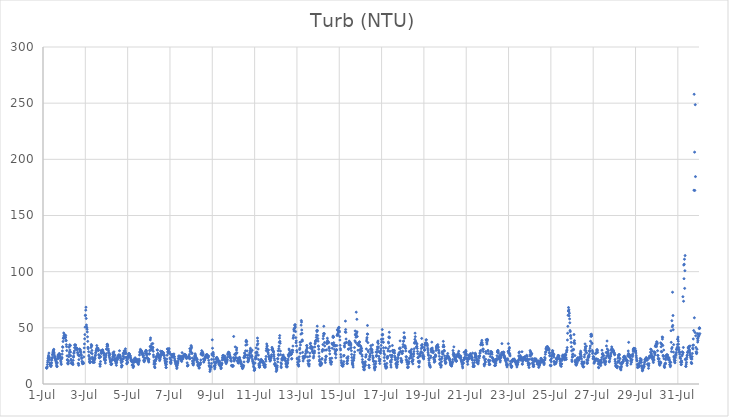
| Category | Turb (NTU) |
|---|---|
| 44743.166666666664 | 14.4 |
| 44743.177083333336 | 14.01 |
| 44743.1875 | 14.77 |
| 44743.197916666664 | 15.36 |
| 44743.208333333336 | 17.35 |
| 44743.21875 | 19.37 |
| 44743.229166666664 | 20.86 |
| 44743.239583333336 | 22.7 |
| 44743.25 | 23.81 |
| 44743.260416666664 | 25.5 |
| 44743.270833333336 | 24.44 |
| 44743.28125 | 27.52 |
| 44743.291666666664 | 22.97 |
| 44743.302083333336 | 23.61 |
| 44743.3125 | 21.58 |
| 44743.322916666664 | 18.9 |
| 44743.333333333336 | 17.59 |
| 44743.34375 | 17.52 |
| 44743.354166666664 | 16.21 |
| 44743.364583333336 | 16.47 |
| 44743.375 | 15.57 |
| 44743.385416666664 | 18.74 |
| 44743.395833333336 | 16.57 |
| 44743.40625 | 18.84 |
| 44743.416666666664 | 21.19 |
| 44743.427083333336 | 22.76 |
| 44743.4375 | 23.56 |
| 44743.447916666664 | 25.94 |
| 44743.458333333336 | 26.6 |
| 44743.46875 | 27.89 |
| 44743.479166666664 | 29.06 |
| 44743.489583333336 | 29.71 |
| 44743.5 | 30.24 |
| 44743.510416666664 | 30.88 |
| 44743.520833333336 | 28.19 |
| 44743.53125 | 26.65 |
| 44743.541666666664 | 24.9 |
| 44743.552083333336 | 23.73 |
| 44743.5625 | 24.3 |
| 44743.572916666664 | 22.57 |
| 44743.583333333336 | 22.98 |
| 44743.59375 | 21.57 |
| 44743.604166666664 | 21.01 |
| 44743.614583333336 | 19.93 |
| 44743.625 | 19.46 |
| 44743.635416666664 | 18.03 |
| 44743.645833333336 | 16.54 |
| 44743.65625 | 15.48 |
| 44743.666666666664 | 15.66 |
| 44743.677083333336 | 18.86 |
| 44743.6875 | 22.33 |
| 44743.697916666664 | 24.09 |
| 44743.708333333336 | 25.77 |
| 44743.71875 | 25.64 |
| 44743.729166666664 | 22.9 |
| 44743.739583333336 | 24.09 |
| 44743.75 | 25.44 |
| 44743.760416666664 | 26.64 |
| 44743.770833333336 | 27.17 |
| 44743.78125 | 25.83 |
| 44743.791666666664 | 26.3 |
| 44743.802083333336 | 25.07 |
| 44743.8125 | 23.76 |
| 44743.822916666664 | 22.84 |
| 44743.833333333336 | 21.23 |
| 44743.84375 | 19.86 |
| 44743.854166666664 | 18.59 |
| 44743.864583333336 | 17.41 |
| 44743.875 | 22.42 |
| 44743.885416666664 | 22.65 |
| 44743.895833333336 | 23.63 |
| 44743.90625 | 26.59 |
| 44743.916666666664 | 29.39 |
| 44743.927083333336 | 33.14 |
| 44743.9375 | 32.75 |
| 44743.947916666664 | 37.85 |
| 44743.958333333336 | 40.79 |
| 44743.96875 | 40.76 |
| 44743.979166666664 | 45.38 |
| 44743.989583333336 | 42.96 |
| 44744.0 | 42.14 |
| 44744.010416666664 | 40.98 |
| 44744.020833333336 | 41.68 |
| 44744.03125 | 43.91 |
| 44744.041666666664 | 42 |
| 44744.052083333336 | 41.17 |
| 44744.0625 | 41.36 |
| 44744.072916666664 | 43.15 |
| 44744.083333333336 | 38.93 |
| 44744.09375 | 38.52 |
| 44744.104166666664 | 35.05 |
| 44744.114583333336 | 33.26 |
| 44744.125 | 29.78 |
| 44744.135416666664 | 25.08 |
| 44744.145833333336 | 21.38 |
| 44744.15625 | 21.68 |
| 44744.166666666664 | 18.72 |
| 44744.177083333336 | 17.98 |
| 44744.1875 | 17.88 |
| 44744.197916666664 | 18.67 |
| 44744.208333333336 | 20.43 |
| 44744.21875 | 24.26 |
| 44744.229166666664 | 32.73 |
| 44744.239583333336 | 26.37 |
| 44744.25 | 28.37 |
| 44744.260416666664 | 34.87 |
| 44744.270833333336 | 30.29 |
| 44744.28125 | 34.5 |
| 44744.291666666664 | 34.1 |
| 44744.302083333336 | 28.42 |
| 44744.3125 | 25.2 |
| 44744.322916666664 | 22.08 |
| 44744.333333333336 | 20.9 |
| 44744.34375 | 18.67 |
| 44744.354166666664 | 18.15 |
| 44744.364583333336 | 18.71 |
| 44744.375 | 18.35 |
| 44744.385416666664 | 18.88 |
| 44744.395833333336 | 18.67 |
| 44744.40625 | 18.01 |
| 44744.416666666664 | 17.29 |
| 44744.427083333336 | 21.03 |
| 44744.4375 | 23.84 |
| 44744.447916666664 | 24.77 |
| 44744.458333333336 | 27.26 |
| 44744.46875 | 27.88 |
| 44744.479166666664 | 29.35 |
| 44744.489583333336 | 32.32 |
| 44744.5 | 34.85 |
| 44744.510416666664 | 34.69 |
| 44744.520833333336 | 34.36 |
| 44744.53125 | 32.27 |
| 44744.541666666664 | 34.81 |
| 44744.552083333336 | 31.1 |
| 44744.5625 | 30.94 |
| 44744.572916666664 | 31.24 |
| 44744.583333333336 | 32.24 |
| 44744.59375 | 30.4 |
| 44744.604166666664 | 31.6 |
| 44744.614583333336 | 31.41 |
| 44744.625 | 30.93 |
| 44744.635416666664 | 28.02 |
| 44744.645833333336 | 27.64 |
| 44744.65625 | 25.94 |
| 44744.666666666664 | 18.22 |
| 44744.677083333336 | 18.21 |
| 44744.6875 | 16.66 |
| 44744.697916666664 | 21.72 |
| 44744.708333333336 | 24.9 |
| 44744.71875 | 25.7 |
| 44744.729166666664 | 31.25 |
| 44744.739583333336 | 29.37 |
| 44744.75 | 30 |
| 44744.760416666664 | 30.59 |
| 44744.770833333336 | 29.13 |
| 44744.78125 | 28.19 |
| 44744.791666666664 | 25.67 |
| 44744.802083333336 | 26.51 |
| 44744.8125 | 25.55 |
| 44744.822916666664 | 23.44 |
| 44744.833333333336 | 22.7 |
| 44744.84375 | 20.12 |
| 44744.854166666664 | 19.51 |
| 44744.864583333336 | 18.11 |
| 44744.875 | 18.68 |
| 44744.885416666664 | 18.14 |
| 44744.895833333336 | 19.46 |
| 44744.90625 | 18.5 |
| 44744.916666666664 | 18.35 |
| 44744.927083333336 | 24.13 |
| 44744.9375 | 28.42 |
| 44744.947916666664 | 32.11 |
| 44744.958333333336 | 35.66 |
| 44744.96875 | 40.22 |
| 44744.979166666664 | 43.97 |
| 44744.989583333336 | 50.62 |
| 44745.0 | 60.97 |
| 44745.010416666664 | 61.2 |
| 44745.020833333336 | 65.72 |
| 44745.03125 | 68.35 |
| 44745.041666666664 | 58.34 |
| 44745.052083333336 | 52.52 |
| 44745.0625 | 50.55 |
| 44745.072916666664 | 50.01 |
| 44745.083333333336 | 48.65 |
| 44745.09375 | 46.33 |
| 44745.104166666664 | 41.99 |
| 44745.114583333336 | 37.97 |
| 44745.125 | 32.64 |
| 44745.135416666664 | 31.42 |
| 44745.15625 | 28.76 |
| 44745.166666666664 | 25.52 |
| 44745.177083333336 | 24.43 |
| 44745.1875 | 22.18 |
| 44745.197916666664 | 20.25 |
| 44745.208333333336 | 19.49 |
| 44745.21875 | 18.89 |
| 44745.229166666664 | 19.65 |
| 44745.239583333336 | 19.88 |
| 44745.25 | 22.88 |
| 44745.260416666664 | 27.85 |
| 44745.270833333336 | 32.48 |
| 44745.28125 | 35.12 |
| 44745.291666666664 | 33.95 |
| 44745.302083333336 | 34.12 |
| 44745.3125 | 29.83 |
| 44745.322916666664 | 26.96 |
| 44745.333333333336 | 23.92 |
| 44745.34375 | 21.9 |
| 44745.354166666664 | 19.91 |
| 44745.364583333336 | 19.36 |
| 44745.375 | 19.14 |
| 44745.385416666664 | 22.78 |
| 44745.395833333336 | 21.23 |
| 44745.40625 | 21.66 |
| 44745.416666666664 | 20.67 |
| 44745.427083333336 | 19.25 |
| 44745.4375 | 21.78 |
| 44745.447916666664 | 23.19 |
| 44745.458333333336 | 22.83 |
| 44745.46875 | 24.99 |
| 44745.479166666664 | 25.73 |
| 44745.489583333336 | 27.65 |
| 44745.5 | 28.37 |
| 44745.510416666664 | 29.55 |
| 44745.520833333336 | 30.11 |
| 44745.53125 | 31.31 |
| 44745.541666666664 | 34.21 |
| 44745.552083333336 | 30.25 |
| 44745.5625 | 32.24 |
| 44745.572916666664 | 30.97 |
| 44745.583333333336 | 30.69 |
| 44745.59375 | 30.37 |
| 44745.604166666664 | 31.75 |
| 44745.614583333336 | 29.77 |
| 44745.625 | 30.13 |
| 44745.635416666664 | 26.19 |
| 44745.645833333336 | 25.62 |
| 44745.65625 | 23.42 |
| 44745.666666666664 | 23.22 |
| 44745.677083333336 | 25.14 |
| 44745.6875 | 17.89 |
| 44745.697916666664 | 15.79 |
| 44745.708333333336 | 17.45 |
| 44745.71875 | 19.98 |
| 44745.729166666664 | 24.22 |
| 44745.739583333336 | 29.7 |
| 44745.75 | 28.08 |
| 44745.760416666664 | 27.3 |
| 44745.770833333336 | 27.52 |
| 44745.78125 | 29.8 |
| 44745.791666666664 | 29.36 |
| 44745.802083333336 | 29.84 |
| 44745.8125 | 30.43 |
| 44745.822916666664 | 30.03 |
| 44745.833333333336 | 28.8 |
| 44745.84375 | 28.15 |
| 44745.854166666664 | 27.33 |
| 44745.864583333336 | 27.53 |
| 44745.875 | 26.93 |
| 44745.885416666664 | 25.33 |
| 44745.895833333336 | 23.21 |
| 44745.90625 | 21.54 |
| 44745.916666666664 | 21.91 |
| 44745.927083333336 | 22.66 |
| 44745.9375 | 20.73 |
| 44745.947916666664 | 18.67 |
| 44745.958333333336 | 21.28 |
| 44745.96875 | 23.97 |
| 44745.979166666664 | 25.78 |
| 44745.989583333336 | 27 |
| 44746.0 | 30.9 |
| 44746.010416666664 | 31.29 |
| 44746.020833333336 | 33.37 |
| 44746.03125 | 35.32 |
| 44746.041666666664 | 35.33 |
| 44746.052083333336 | 34.76 |
| 44746.0625 | 33.78 |
| 44746.072916666664 | 31 |
| 44746.083333333336 | 31.26 |
| 44746.09375 | 29.57 |
| 44746.104166666664 | 28.08 |
| 44746.114583333336 | 27.61 |
| 44746.125 | 25.05 |
| 44746.135416666664 | 25.63 |
| 44746.145833333336 | 23.63 |
| 44746.15625 | 22.29 |
| 44746.166666666664 | 26.61 |
| 44746.177083333336 | 20.51 |
| 44746.1875 | 19.58 |
| 44746.197916666664 | 19.98 |
| 44746.208333333336 | 17.52 |
| 44746.21875 | 17.89 |
| 44746.229166666664 | 17.3 |
| 44746.239583333336 | 17.75 |
| 44746.25 | 18.03 |
| 44746.260416666664 | 21.37 |
| 44746.270833333336 | 22.05 |
| 44746.28125 | 21.35 |
| 44746.291666666664 | 24.02 |
| 44746.302083333336 | 27.65 |
| 44746.3125 | 26.17 |
| 44746.322916666664 | 24.72 |
| 44746.333333333336 | 25.53 |
| 44746.34375 | 27.58 |
| 44746.354166666664 | 28.66 |
| 44746.364583333336 | 24.18 |
| 44746.375 | 22.24 |
| 44746.385416666664 | 21.14 |
| 44746.395833333336 | 21.32 |
| 44746.40625 | 25.66 |
| 44746.416666666664 | 22.56 |
| 44746.427083333336 | 20.08 |
| 44746.4375 | 20.69 |
| 44746.447916666664 | 18.4 |
| 44746.458333333336 | 19.09 |
| 44746.46875 | 16.64 |
| 44746.479166666664 | 18.99 |
| 44746.489583333336 | 20.63 |
| 44746.5 | 23.16 |
| 44746.510416666664 | 21.83 |
| 44746.520833333336 | 21.85 |
| 44746.53125 | 24.05 |
| 44746.541666666664 | 23.2 |
| 44746.552083333336 | 24.67 |
| 44746.5625 | 25.23 |
| 44746.572916666664 | 24.7 |
| 44746.583333333336 | 26.03 |
| 44746.59375 | 25.86 |
| 44746.604166666664 | 25.17 |
| 44746.614583333336 | 29.58 |
| 44746.625 | 23.93 |
| 44746.635416666664 | 23.83 |
| 44746.645833333336 | 25.58 |
| 44746.65625 | 24.05 |
| 44746.666666666664 | 22.85 |
| 44746.677083333336 | 20.76 |
| 44746.6875 | 21.73 |
| 44746.697916666664 | 18.89 |
| 44746.708333333336 | 15.05 |
| 44746.71875 | 16.55 |
| 44746.729166666664 | 16.12 |
| 44746.739583333336 | 16.34 |
| 44746.75 | 19.92 |
| 44746.760416666664 | 21.97 |
| 44746.770833333336 | 22.09 |
| 44746.78125 | 24.71 |
| 44746.791666666664 | 26.93 |
| 44746.802083333336 | 27.62 |
| 44746.8125 | 22.72 |
| 44746.822916666664 | 24.27 |
| 44746.833333333336 | 29.47 |
| 44746.84375 | 28.33 |
| 44746.854166666664 | 26.95 |
| 44746.864583333336 | 28.37 |
| 44746.875 | 28.12 |
| 44746.885416666664 | 29.81 |
| 44746.895833333336 | 31.32 |
| 44746.90625 | 28.27 |
| 44746.916666666664 | 26.98 |
| 44746.927083333336 | 23.71 |
| 44746.9375 | 23.58 |
| 44746.947916666664 | 21.05 |
| 44746.958333333336 | 17.95 |
| 44746.96875 | 18.33 |
| 44746.979166666664 | 19.01 |
| 44746.989583333336 | 21.64 |
| 44747.0 | 19.44 |
| 44747.010416666664 | 23.24 |
| 44747.020833333336 | 23.87 |
| 44747.03125 | 25.16 |
| 44747.041666666664 | 25.65 |
| 44747.052083333336 | 26.89 |
| 44747.0625 | 27.16 |
| 44747.072916666664 | 26.46 |
| 44747.083333333336 | 26.8 |
| 44747.09375 | 25.47 |
| 44747.104166666664 | 24.8 |
| 44747.114583333336 | 24.57 |
| 44747.125 | 25.17 |
| 44747.135416666664 | 23.49 |
| 44747.145833333336 | 22.58 |
| 44747.15625 | 21.36 |
| 44747.166666666664 | 21.21 |
| 44747.177083333336 | 21 |
| 44747.1875 | 20.22 |
| 44747.197916666664 | 19.75 |
| 44747.208333333336 | 19.77 |
| 44747.21875 | 16.64 |
| 44747.229166666664 | 17.17 |
| 44747.239583333336 | 20.96 |
| 44747.25 | 17.07 |
| 44747.260416666664 | 14.66 |
| 44747.270833333336 | 15.79 |
| 44747.28125 | 15.83 |
| 44747.291666666664 | 19.09 |
| 44747.302083333336 | 20.18 |
| 44747.3125 | 22.25 |
| 44747.322916666664 | 20.14 |
| 44747.333333333336 | 20.93 |
| 44747.34375 | 20.51 |
| 44747.354166666664 | 23.34 |
| 44747.364583333336 | 20.38 |
| 44747.375 | 20.67 |
| 44747.385416666664 | 22.01 |
| 44747.395833333336 | 19.84 |
| 44747.40625 | 20.47 |
| 44747.416666666664 | 20.45 |
| 44747.427083333336 | 20.85 |
| 44747.4375 | 21.99 |
| 44747.447916666664 | 20.67 |
| 44747.458333333336 | 20.7 |
| 44747.46875 | 19.66 |
| 44747.479166666664 | 19.86 |
| 44747.489583333336 | 18.22 |
| 44747.5 | 18.37 |
| 44747.510416666664 | 17.35 |
| 44747.520833333336 | 19.29 |
| 44747.53125 | 20.85 |
| 44747.541666666664 | 22.15 |
| 44747.552083333336 | 20.59 |
| 44747.5625 | 25.81 |
| 44747.572916666664 | 28.46 |
| 44747.583333333336 | 27.7 |
| 44747.59375 | 28.62 |
| 44747.604166666664 | 30.83 |
| 44747.614583333336 | 29.48 |
| 44747.625 | 28.88 |
| 44747.635416666664 | 29.6 |
| 44747.645833333336 | 29.83 |
| 44747.65625 | 28.63 |
| 44747.666666666664 | 28.76 |
| 44747.677083333336 | 28.25 |
| 44747.6875 | 26.65 |
| 44747.697916666664 | 27.02 |
| 44747.708333333336 | 26.02 |
| 44747.71875 | 27.21 |
| 44747.729166666664 | 25.15 |
| 44747.739583333336 | 23.98 |
| 44747.75 | 25.39 |
| 44747.760416666664 | 20.72 |
| 44747.770833333336 | 21.43 |
| 44747.78125 | 19.75 |
| 44747.791666666664 | 21.08 |
| 44747.802083333336 | 20.71 |
| 44747.8125 | 22.81 |
| 44747.822916666664 | 23.07 |
| 44747.833333333336 | 27.13 |
| 44747.84375 | 28.72 |
| 44747.854166666664 | 29.15 |
| 44747.864583333336 | 29.97 |
| 44747.875 | 28.71 |
| 44747.885416666664 | 29.63 |
| 44747.895833333336 | 26.87 |
| 44747.90625 | 25.31 |
| 44747.916666666664 | 27.04 |
| 44747.927083333336 | 23.34 |
| 44747.9375 | 22.89 |
| 44747.947916666664 | 22.38 |
| 44747.958333333336 | 22.45 |
| 44747.96875 | 22.34 |
| 44747.979166666664 | 21.09 |
| 44747.989583333336 | 20.26 |
| 44748.0 | 19.5 |
| 44748.010416666664 | 22.07 |
| 44748.020833333336 | 26.98 |
| 44748.03125 | 26.73 |
| 44748.041666666664 | 29.54 |
| 44748.052083333336 | 30.28 |
| 44748.0625 | 33.33 |
| 44748.072916666664 | 39.27 |
| 44748.083333333336 | 41 |
| 44748.09375 | 33.84 |
| 44748.104166666664 | 33.6 |
| 44748.114583333336 | 32.57 |
| 44748.125 | 31.89 |
| 44748.135416666664 | 35.65 |
| 44748.145833333336 | 30.31 |
| 44748.15625 | 30.77 |
| 44748.166666666664 | 31.09 |
| 44748.177083333336 | 32.84 |
| 44748.1875 | 36 |
| 44748.197916666664 | 32.38 |
| 44748.208333333336 | 29.15 |
| 44748.21875 | 25.86 |
| 44748.229166666664 | 24.12 |
| 44748.239583333336 | 17.7 |
| 44748.25 | 20.58 |
| 44748.260416666664 | 19.17 |
| 44748.270833333336 | 15.31 |
| 44748.28125 | 17.36 |
| 44748.291666666664 | 14.5 |
| 44748.302083333336 | 18.04 |
| 44748.3125 | 20.25 |
| 44748.322916666664 | 21.62 |
| 44748.333333333336 | 22.09 |
| 44748.34375 | 21.71 |
| 44748.354166666664 | 23.19 |
| 44748.364583333336 | 24.41 |
| 44748.375 | 24.76 |
| 44748.385416666664 | 24.65 |
| 44748.395833333336 | 30.39 |
| 44748.40625 | 30.15 |
| 44748.416666666664 | 26.9 |
| 44748.427083333336 | 26.49 |
| 44748.4375 | 27.21 |
| 44748.447916666664 | 26.15 |
| 44748.458333333336 | 26.12 |
| 44748.46875 | 23.24 |
| 44748.479166666664 | 24.33 |
| 44748.489583333336 | 25.33 |
| 44748.5 | 25.25 |
| 44748.510416666664 | 20.77 |
| 44748.520833333336 | 22.64 |
| 44748.53125 | 21.91 |
| 44748.541666666664 | 23.56 |
| 44748.552083333336 | 29.19 |
| 44748.5625 | 24.92 |
| 44748.572916666664 | 26.08 |
| 44748.583333333336 | 25.83 |
| 44748.59375 | 27.36 |
| 44748.604166666664 | 27.97 |
| 44748.614583333336 | 28.9 |
| 44748.625 | 28.98 |
| 44748.635416666664 | 27.67 |
| 44748.645833333336 | 27.64 |
| 44748.65625 | 28.14 |
| 44748.666666666664 | 28.03 |
| 44748.677083333336 | 25.95 |
| 44748.6875 | 26.73 |
| 44748.697916666664 | 27.84 |
| 44748.708333333336 | 26.19 |
| 44748.71875 | 25.73 |
| 44748.729166666664 | 25.04 |
| 44748.739583333336 | 22.97 |
| 44748.75 | 22.8 |
| 44748.760416666664 | 21.24 |
| 44748.770833333336 | 20.34 |
| 44748.78125 | 18.81 |
| 44748.791666666664 | 18.14 |
| 44748.802083333336 | 16.84 |
| 44748.8125 | 14.77 |
| 44748.822916666664 | 14.62 |
| 44748.833333333336 | 17.52 |
| 44748.84375 | 19.84 |
| 44748.854166666664 | 22.24 |
| 44748.864583333336 | 25.57 |
| 44748.875 | 31.26 |
| 44748.885416666664 | 30.95 |
| 44748.895833333336 | 28.78 |
| 44748.90625 | 28.12 |
| 44748.916666666664 | 27.45 |
| 44748.927083333336 | 29.35 |
| 44748.9375 | 30.36 |
| 44748.947916666664 | 30.37 |
| 44748.958333333336 | 31.61 |
| 44748.96875 | 28.79 |
| 44748.979166666664 | 27.94 |
| 44748.989583333336 | 26.99 |
| 44749.0 | 23.26 |
| 44749.010416666664 | 22.32 |
| 44749.020833333336 | 19.04 |
| 44749.03125 | 19.93 |
| 44749.041666666664 | 18.2 |
| 44749.052083333336 | 19.24 |
| 44749.0625 | 21.2 |
| 44749.072916666664 | 25.54 |
| 44749.083333333336 | 26.29 |
| 44749.09375 | 23.95 |
| 44749.104166666664 | 24.41 |
| 44749.114583333336 | 24.07 |
| 44749.125 | 25.94 |
| 44749.135416666664 | 25 |
| 44749.145833333336 | 26.46 |
| 44749.15625 | 26.15 |
| 44749.166666666664 | 25.3 |
| 44749.177083333336 | 24.7 |
| 44749.1875 | 26.74 |
| 44749.197916666664 | 24.59 |
| 44749.208333333336 | 24.18 |
| 44749.21875 | 22.6 |
| 44749.229166666664 | 21.17 |
| 44749.239583333336 | 20.52 |
| 44749.25 | 19.59 |
| 44749.260416666664 | 20.32 |
| 44749.270833333336 | 17.92 |
| 44749.28125 | 17.86 |
| 44749.291666666664 | 17.06 |
| 44749.302083333336 | 18.37 |
| 44749.3125 | 15.8 |
| 44749.322916666664 | 13.78 |
| 44749.333333333336 | 14.93 |
| 44749.34375 | 19.24 |
| 44749.354166666664 | 16.91 |
| 44749.364583333336 | 18.75 |
| 44749.375 | 18.71 |
| 44749.385416666664 | 20.38 |
| 44749.395833333336 | 22.6 |
| 44749.40625 | 22.79 |
| 44749.416666666664 | 24.99 |
| 44749.427083333336 | 24.66 |
| 44749.4375 | 24.3 |
| 44749.447916666664 | 24.41 |
| 44749.458333333336 | 24.1 |
| 44749.46875 | 24.98 |
| 44749.479166666664 | 22.9 |
| 44749.489583333336 | 22.22 |
| 44749.5 | 22.4 |
| 44749.510416666664 | 21.52 |
| 44749.520833333336 | 22.54 |
| 44749.53125 | 22.72 |
| 44749.541666666664 | 20.86 |
| 44749.552083333336 | 20.06 |
| 44749.5625 | 24.72 |
| 44749.572916666664 | 27.89 |
| 44749.583333333336 | 23.3 |
| 44749.59375 | 23.45 |
| 44749.604166666664 | 22.12 |
| 44749.614583333336 | 22.84 |
| 44749.625 | 24.41 |
| 44749.635416666664 | 24.82 |
| 44749.645833333336 | 24.28 |
| 44749.65625 | 25.83 |
| 44749.666666666664 | 25.23 |
| 44749.677083333336 | 26.38 |
| 44749.6875 | 26.02 |
| 44749.697916666664 | 26.07 |
| 44749.708333333336 | 25.42 |
| 44749.71875 | 25.03 |
| 44749.729166666664 | 26.02 |
| 44749.739583333336 | 25.96 |
| 44749.75 | 24.02 |
| 44749.760416666664 | 23.87 |
| 44749.770833333336 | 24.91 |
| 44749.78125 | 22.67 |
| 44749.791666666664 | 23.21 |
| 44749.802083333336 | 23.19 |
| 44749.8125 | 18.86 |
| 44749.822916666664 | 16.04 |
| 44749.833333333336 | 16.43 |
| 44749.84375 | 16.26 |
| 44749.854166666664 | 16.94 |
| 44749.864583333336 | 23.37 |
| 44749.875 | 23.9 |
| 44749.885416666664 | 24.17 |
| 44749.895833333336 | 24.73 |
| 44749.90625 | 24.32 |
| 44749.916666666664 | 26.28 |
| 44749.927083333336 | 22.47 |
| 44749.9375 | 31.49 |
| 44749.947916666664 | 22.74 |
| 44749.958333333336 | 29.03 |
| 44749.96875 | 29.59 |
| 44749.979166666664 | 28.44 |
| 44749.989583333336 | 31.11 |
| 44750.0 | 34.19 |
| 44750.010416666664 | 33.42 |
| 44750.020833333336 | 32.21 |
| 44750.03125 | 27.88 |
| 44750.041666666664 | 27.1 |
| 44750.052083333336 | 23.1 |
| 44750.0625 | 20.47 |
| 44750.072916666664 | 18.29 |
| 44750.083333333336 | 18.55 |
| 44750.09375 | 17.05 |
| 44750.104166666664 | 17.02 |
| 44750.114583333336 | 18.56 |
| 44750.125 | 20.74 |
| 44750.135416666664 | 21.42 |
| 44750.145833333336 | 22.8 |
| 44750.15625 | 22.23 |
| 44750.166666666664 | 24.54 |
| 44750.177083333336 | 25.2 |
| 44750.1875 | 26.93 |
| 44750.197916666664 | 25.99 |
| 44750.208333333336 | 24.94 |
| 44750.21875 | 23.12 |
| 44750.229166666664 | 23.81 |
| 44750.239583333336 | 23.07 |
| 44750.25 | 22.73 |
| 44750.260416666664 | 21.44 |
| 44750.270833333336 | 20.6 |
| 44750.28125 | 19.48 |
| 44750.291666666664 | 22 |
| 44750.302083333336 | 19.67 |
| 44750.3125 | 17 |
| 44750.322916666664 | 16.21 |
| 44750.333333333336 | 17.81 |
| 44750.34375 | 17.69 |
| 44750.354166666664 | 16.04 |
| 44750.364583333336 | 16.12 |
| 44750.375 | 14.08 |
| 44750.385416666664 | 14.54 |
| 44750.395833333336 | 16.62 |
| 44750.40625 | 17.24 |
| 44750.416666666664 | 17.09 |
| 44750.427083333336 | 17.38 |
| 44750.4375 | 18.85 |
| 44750.447916666664 | 18.78 |
| 44750.458333333336 | 21.37 |
| 44750.46875 | 26.47 |
| 44750.479166666664 | 27.47 |
| 44750.489583333336 | 26.92 |
| 44750.5 | 29.68 |
| 44750.510416666664 | 27.16 |
| 44750.520833333336 | 25.62 |
| 44750.53125 | 26.45 |
| 44750.541666666664 | 28.43 |
| 44750.552083333336 | 25.77 |
| 44750.5625 | 27.33 |
| 44750.572916666664 | 25.83 |
| 44750.583333333336 | 22.19 |
| 44750.59375 | 19.63 |
| 44750.604166666664 | 19.62 |
| 44750.614583333336 | 21.35 |
| 44750.625 | 22.35 |
| 44750.635416666664 | 21.5 |
| 44750.645833333336 | 21.44 |
| 44750.65625 | 22.53 |
| 44750.666666666664 | 23.85 |
| 44750.677083333336 | 24.41 |
| 44750.6875 | 23.9 |
| 44750.697916666664 | 24.29 |
| 44750.708333333336 | 25.91 |
| 44750.71875 | 25.3 |
| 44750.729166666664 | 25.5 |
| 44750.739583333336 | 26.06 |
| 44750.75 | 26.22 |
| 44750.760416666664 | 24.83 |
| 44750.770833333336 | 23.47 |
| 44750.78125 | 24.11 |
| 44750.791666666664 | 23.3 |
| 44750.802083333336 | 24.37 |
| 44750.8125 | 23.95 |
| 44750.822916666664 | 25.03 |
| 44750.833333333336 | 21.03 |
| 44750.84375 | 18.69 |
| 44750.854166666664 | 16.39 |
| 44750.864583333336 | 15.8 |
| 44750.875 | 15.31 |
| 44750.885416666664 | 11.14 |
| 44750.895833333336 | 13.16 |
| 44750.90625 | 12.5 |
| 44750.916666666664 | 15.91 |
| 44750.927083333336 | 15.06 |
| 44750.9375 | 15.48 |
| 44750.947916666664 | 14.84 |
| 44750.958333333336 | 18.26 |
| 44750.96875 | 21.93 |
| 44750.979166666664 | 26.75 |
| 44750.989583333336 | 25.78 |
| 44751.0 | 39.33 |
| 44751.010416666664 | 31.82 |
| 44751.020833333336 | 26.64 |
| 44751.03125 | 26.86 |
| 44751.041666666664 | 28.16 |
| 44751.052083333336 | 26.5 |
| 44751.0625 | 24.6 |
| 44751.072916666664 | 21.8 |
| 44751.083333333336 | 19.29 |
| 44751.09375 | 16.29 |
| 44751.104166666664 | 15.67 |
| 44751.114583333336 | 13.47 |
| 44751.125 | 14.91 |
| 44751.135416666664 | 16.51 |
| 44751.145833333336 | 17.97 |
| 44751.15625 | 18.94 |
| 44751.166666666664 | 19.34 |
| 44751.177083333336 | 19.76 |
| 44751.1875 | 22.97 |
| 44751.197916666664 | 21.82 |
| 44751.208333333336 | 23.57 |
| 44751.21875 | 23.58 |
| 44751.229166666664 | 22.42 |
| 44751.239583333336 | 21.84 |
| 44751.25 | 22.41 |
| 44751.260416666664 | 21.66 |
| 44751.270833333336 | 20.38 |
| 44751.28125 | 21.03 |
| 44751.291666666664 | 19.07 |
| 44751.302083333336 | 20.49 |
| 44751.3125 | 17.88 |
| 44751.322916666664 | 17.25 |
| 44751.333333333336 | 18.43 |
| 44751.34375 | 18.47 |
| 44751.354166666664 | 20.12 |
| 44751.364583333336 | 16.15 |
| 44751.375 | 15.95 |
| 44751.385416666664 | 18.1 |
| 44751.395833333336 | 15.31 |
| 44751.40625 | 13.66 |
| 44751.416666666664 | 16.56 |
| 44751.427083333336 | 14.31 |
| 44751.4375 | 17.09 |
| 44751.447916666664 | 17.9 |
| 44751.458333333336 | 18.51 |
| 44751.46875 | 21.36 |
| 44751.479166666664 | 23.23 |
| 44751.489583333336 | 23.83 |
| 44751.5 | 25.06 |
| 44751.510416666664 | 25.47 |
| 44751.520833333336 | 25.41 |
| 44751.53125 | 24.45 |
| 44751.541666666664 | 24.5 |
| 44751.552083333336 | 21.7 |
| 44751.5625 | 23.3 |
| 44751.572916666664 | 22.88 |
| 44751.583333333336 | 22.28 |
| 44751.59375 | 24.9 |
| 44751.604166666664 | 22.21 |
| 44751.614583333336 | 22.94 |
| 44751.625 | 20.19 |
| 44751.635416666664 | 19.25 |
| 44751.645833333336 | 20.53 |
| 44751.65625 | 18.1 |
| 44751.666666666664 | 21.08 |
| 44751.677083333336 | 19.45 |
| 44751.6875 | 19.93 |
| 44751.697916666664 | 20.95 |
| 44751.708333333336 | 21.83 |
| 44751.71875 | 23.84 |
| 44751.729166666664 | 26.09 |
| 44751.739583333336 | 27.37 |
| 44751.75 | 26.94 |
| 44751.760416666664 | 28.14 |
| 44751.770833333336 | 28.2 |
| 44751.78125 | 27.98 |
| 44751.791666666664 | 27.01 |
| 44751.802083333336 | 27.63 |
| 44751.8125 | 24.27 |
| 44751.822916666664 | 25.88 |
| 44751.833333333336 | 24.87 |
| 44751.84375 | 24.43 |
| 44751.854166666664 | 23 |
| 44751.864583333336 | 22.97 |
| 44751.875 | 21.15 |
| 44751.885416666664 | 20.64 |
| 44751.895833333336 | 20.28 |
| 44751.90625 | 16.4 |
| 44751.916666666664 | 16.55 |
| 44751.927083333336 | 16.39 |
| 44751.9375 | 16.05 |
| 44751.947916666664 | 16.42 |
| 44751.958333333336 | 15.59 |
| 44751.96875 | 16.43 |
| 44751.979166666664 | 16 |
| 44751.989583333336 | 16.11 |
| 44752.0 | 23.45 |
| 44752.010416666664 | 42.32 |
| 44752.020833333336 | 22.34 |
| 44752.03125 | 20.39 |
| 44752.041666666664 | 21.99 |
| 44752.052083333336 | 26.31 |
| 44752.0625 | 21.64 |
| 44752.072916666664 | 23.17 |
| 44752.083333333336 | 33.03 |
| 44752.09375 | 26.15 |
| 44752.104166666664 | 23.8 |
| 44752.114583333336 | 27.47 |
| 44752.125 | 26.7 |
| 44752.135416666664 | 27.52 |
| 44752.145833333336 | 30.31 |
| 44752.15625 | 32.11 |
| 44752.166666666664 | 27.8 |
| 44752.177083333336 | 22.94 |
| 44752.1875 | 20.71 |
| 44752.197916666664 | 20.72 |
| 44752.208333333336 | 19.99 |
| 44752.21875 | 18.77 |
| 44752.229166666664 | 18.89 |
| 44752.239583333336 | 18.89 |
| 44752.25 | 20.45 |
| 44752.260416666664 | 22.7 |
| 44752.270833333336 | 22.38 |
| 44752.28125 | 23.64 |
| 44752.291666666664 | 23.46 |
| 44752.302083333336 | 21.54 |
| 44752.3125 | 21.32 |
| 44752.322916666664 | 20.63 |
| 44752.333333333336 | 19.34 |
| 44752.34375 | 18.92 |
| 44752.354166666664 | 19.59 |
| 44752.364583333336 | 17.55 |
| 44752.375 | 17.94 |
| 44752.385416666664 | 15.75 |
| 44752.395833333336 | 17.1 |
| 44752.40625 | 15.47 |
| 44752.416666666664 | 14.26 |
| 44752.427083333336 | 13.75 |
| 44752.4375 | 14.16 |
| 44752.447916666664 | 15.29 |
| 44752.458333333336 | 14.57 |
| 44752.46875 | 15.87 |
| 44752.479166666664 | 16.48 |
| 44752.489583333336 | 23.41 |
| 44752.5 | 19.66 |
| 44752.510416666664 | 24.79 |
| 44752.520833333336 | 27.58 |
| 44752.53125 | 23.72 |
| 44752.541666666664 | 24.1 |
| 44752.552083333336 | 26.56 |
| 44752.5625 | 25.52 |
| 44752.572916666664 | 29.5 |
| 44752.583333333336 | 34.58 |
| 44752.59375 | 37.79 |
| 44752.604166666664 | 38.87 |
| 44752.614583333336 | 37.74 |
| 44752.625 | 37.75 |
| 44752.635416666664 | 35.11 |
| 44752.645833333336 | 29.44 |
| 44752.65625 | 25.63 |
| 44752.666666666664 | 23.33 |
| 44752.677083333336 | 20.27 |
| 44752.6875 | 19.63 |
| 44752.697916666664 | 20.25 |
| 44752.708333333336 | 21.64 |
| 44752.71875 | 21.4 |
| 44752.729166666664 | 22.55 |
| 44752.739583333336 | 22.77 |
| 44752.75 | 25.74 |
| 44752.760416666664 | 25.04 |
| 44752.770833333336 | 27.37 |
| 44752.78125 | 28.01 |
| 44752.791666666664 | 30.07 |
| 44752.802083333336 | 31.77 |
| 44752.8125 | 29.29 |
| 44752.822916666664 | 27.95 |
| 44752.833333333336 | 28.99 |
| 44752.84375 | 24.01 |
| 44752.854166666664 | 25.66 |
| 44752.864583333336 | 24.64 |
| 44752.875 | 24.71 |
| 44752.885416666664 | 30.06 |
| 44752.895833333336 | 22.1 |
| 44752.90625 | 20.69 |
| 44752.916666666664 | 19.6 |
| 44752.927083333336 | 19.86 |
| 44752.9375 | 18.4 |
| 44752.947916666664 | 15.87 |
| 44752.958333333336 | 17.72 |
| 44752.96875 | 14.75 |
| 44752.979166666664 | 12.1 |
| 44752.989583333336 | 12.39 |
| 44753.0 | 12.51 |
| 44753.010416666664 | 13.75 |
| 44753.020833333336 | 18.67 |
| 44753.03125 | 23.24 |
| 44753.041666666664 | 22.14 |
| 44753.052083333336 | 27.74 |
| 44753.0625 | 24.67 |
| 44753.072916666664 | 32.18 |
| 44753.083333333336 | 22.95 |
| 44753.09375 | 25.66 |
| 44753.104166666664 | 28.55 |
| 44753.114583333336 | 27.88 |
| 44753.125 | 34.76 |
| 44753.135416666664 | 40.89 |
| 44753.145833333336 | 38.3 |
| 44753.15625 | 35.91 |
| 44753.166666666664 | 31.11 |
| 44753.177083333336 | 25.72 |
| 44753.1875 | 21.77 |
| 44753.197916666664 | 17.86 |
| 44753.208333333336 | 16.54 |
| 44753.21875 | 14.98 |
| 44753.229166666664 | 15.2 |
| 44753.239583333336 | 15.08 |
| 44753.25 | 16.57 |
| 44753.260416666664 | 19.06 |
| 44753.270833333336 | 19.6 |
| 44753.28125 | 20.29 |
| 44753.291666666664 | 20.34 |
| 44753.302083333336 | 21.46 |
| 44753.3125 | 21.93 |
| 44753.322916666664 | 21.02 |
| 44753.333333333336 | 21.02 |
| 44753.34375 | 19.53 |
| 44753.354166666664 | 20.46 |
| 44753.364583333336 | 20.41 |
| 44753.375 | 19.93 |
| 44753.385416666664 | 19.97 |
| 44753.395833333336 | 19.95 |
| 44753.40625 | 18.9 |
| 44753.416666666664 | 18.4 |
| 44753.427083333336 | 16.63 |
| 44753.4375 | 18.4 |
| 44753.447916666664 | 17.22 |
| 44753.458333333336 | 15.19 |
| 44753.46875 | 15.48 |
| 44753.479166666664 | 15.64 |
| 44753.489583333336 | 14.92 |
| 44753.5 | 15.16 |
| 44753.510416666664 | 17.09 |
| 44753.520833333336 | 22.21 |
| 44753.53125 | 20.29 |
| 44753.541666666664 | 24.52 |
| 44753.552083333336 | 29.66 |
| 44753.5625 | 31.49 |
| 44753.572916666664 | 35.65 |
| 44753.583333333336 | 33.16 |
| 44753.59375 | 33.95 |
| 44753.604166666664 | 30.92 |
| 44753.614583333336 | 30.06 |
| 44753.625 | 30.12 |
| 44753.635416666664 | 28.14 |
| 44753.645833333336 | 26.65 |
| 44753.65625 | 30.21 |
| 44753.666666666664 | 24.06 |
| 44753.677083333336 | 24.85 |
| 44753.6875 | 24.28 |
| 44753.697916666664 | 22.22 |
| 44753.708333333336 | 22.76 |
| 44753.71875 | 21.71 |
| 44753.729166666664 | 20.32 |
| 44753.739583333336 | 21.41 |
| 44753.75 | 21.05 |
| 44753.760416666664 | 22.9 |
| 44753.770833333336 | 23.86 |
| 44753.78125 | 24.03 |
| 44753.791666666664 | 24.65 |
| 44753.802083333336 | 26.01 |
| 44753.8125 | 30.64 |
| 44753.822916666664 | 32.62 |
| 44753.833333333336 | 30.14 |
| 44753.84375 | 30.96 |
| 44753.854166666664 | 31.25 |
| 44753.864583333336 | 29.98 |
| 44753.875 | 28.51 |
| 44753.885416666664 | 29.22 |
| 44753.895833333336 | 28.46 |
| 44753.90625 | 26.35 |
| 44753.916666666664 | 24.72 |
| 44753.927083333336 | 22.69 |
| 44753.9375 | 17.38 |
| 44753.947916666664 | 21.07 |
| 44753.958333333336 | 18.36 |
| 44753.96875 | 17.97 |
| 44753.979166666664 | 17.56 |
| 44753.989583333336 | 15.95 |
| 44754.0 | 16.26 |
| 44754.010416666664 | 15.86 |
| 44754.020833333336 | 11.19 |
| 44754.03125 | 13.93 |
| 44754.041666666664 | 12.54 |
| 44754.052083333336 | 12.52 |
| 44754.0625 | 14.48 |
| 44754.072916666664 | 16.17 |
| 44754.083333333336 | 22.64 |
| 44754.09375 | 19.69 |
| 44754.104166666664 | 22.44 |
| 44754.114583333336 | 29.57 |
| 44754.125 | 26.3 |
| 44754.135416666664 | 25.47 |
| 44754.145833333336 | 31.46 |
| 44754.15625 | 33.65 |
| 44754.166666666664 | 37.15 |
| 44754.177083333336 | 40.85 |
| 44754.1875 | 43.1 |
| 44754.197916666664 | 37.97 |
| 44754.208333333336 | 36.29 |
| 44754.21875 | 29.33 |
| 44754.229166666664 | 26.15 |
| 44754.239583333336 | 18.83 |
| 44754.25 | 15.82 |
| 44754.260416666664 | 14.58 |
| 44754.270833333336 | 17.86 |
| 44754.28125 | 22.32 |
| 44754.291666666664 | 21.25 |
| 44754.302083333336 | 22.31 |
| 44754.3125 | 21.44 |
| 44754.322916666664 | 23.84 |
| 44754.333333333336 | 25.36 |
| 44754.34375 | 23.86 |
| 44754.354166666664 | 25.77 |
| 44754.364583333336 | 23.89 |
| 44754.375 | 22.95 |
| 44754.385416666664 | 21.96 |
| 44754.395833333336 | 23.26 |
| 44754.40625 | 22.34 |
| 44754.416666666664 | 23.54 |
| 44754.427083333336 | 22.67 |
| 44754.4375 | 22.89 |
| 44754.447916666664 | 22.34 |
| 44754.458333333336 | 20.79 |
| 44754.46875 | 20.46 |
| 44754.479166666664 | 18.46 |
| 44754.489583333336 | 17.46 |
| 44754.5 | 15.48 |
| 44754.510416666664 | 15.78 |
| 44754.520833333336 | 17.24 |
| 44754.53125 | 15.03 |
| 44754.541666666664 | 15.74 |
| 44754.552083333336 | 18.16 |
| 44754.5625 | 18.84 |
| 44754.572916666664 | 20.78 |
| 44754.583333333336 | 22.2 |
| 44754.59375 | 26.11 |
| 44754.604166666664 | 25.33 |
| 44754.614583333336 | 24.44 |
| 44754.625 | 31.13 |
| 44754.635416666664 | 30.22 |
| 44754.645833333336 | 26.9 |
| 44754.65625 | 27.38 |
| 44754.666666666664 | 28.23 |
| 44754.677083333336 | 27.68 |
| 44754.6875 | 28.54 |
| 44754.697916666664 | 26.32 |
| 44754.708333333336 | 26 |
| 44754.71875 | 26.34 |
| 44754.729166666664 | 26.33 |
| 44754.739583333336 | 26.93 |
| 44754.75 | 22.25 |
| 44754.760416666664 | 22.65 |
| 44754.770833333336 | 29.99 |
| 44754.78125 | 29.93 |
| 44754.791666666664 | 28.29 |
| 44754.802083333336 | 29.95 |
| 44754.8125 | 33.75 |
| 44754.822916666664 | 40.69 |
| 44754.833333333336 | 41.66 |
| 44754.84375 | 43.31 |
| 44754.854166666664 | 48.42 |
| 44754.864583333336 | 47.15 |
| 44754.875 | 49.51 |
| 44754.885416666664 | 49.49 |
| 44754.895833333336 | 52.09 |
| 44754.90625 | 52.79 |
| 44754.916666666664 | 52.65 |
| 44754.927083333336 | 50.69 |
| 44754.9375 | 46.7 |
| 44754.947916666664 | 41.29 |
| 44754.958333333336 | 36.75 |
| 44754.96875 | 38.4 |
| 44754.979166666664 | 33.89 |
| 44754.989583333336 | 29.85 |
| 44755.0 | 28.49 |
| 44755.010416666664 | 22.93 |
| 44755.020833333336 | 22.01 |
| 44755.03125 | 19.39 |
| 44755.041666666664 | 17.05 |
| 44755.052083333336 | 17.78 |
| 44755.0625 | 17.09 |
| 44755.072916666664 | 17.2 |
| 44755.083333333336 | 15.87 |
| 44755.09375 | 21.81 |
| 44755.104166666664 | 24.18 |
| 44755.114583333336 | 20.26 |
| 44755.125 | 30.66 |
| 44755.135416666664 | 31.92 |
| 44755.145833333336 | 37.18 |
| 44755.15625 | 27.36 |
| 44755.166666666664 | 34.69 |
| 44755.177083333336 | 37.38 |
| 44755.1875 | 44.39 |
| 44755.197916666664 | 52.39 |
| 44755.208333333336 | 56.5 |
| 44755.21875 | 55.13 |
| 44755.229166666664 | 48.08 |
| 44755.239583333336 | 45.09 |
| 44755.25 | 39.29 |
| 44755.260416666664 | 38.26 |
| 44755.270833333336 | 28.14 |
| 44755.28125 | 24.27 |
| 44755.291666666664 | 20.51 |
| 44755.302083333336 | 22.66 |
| 44755.3125 | 24.45 |
| 44755.322916666664 | 22.61 |
| 44755.333333333336 | 24.57 |
| 44755.34375 | 23.66 |
| 44755.354166666664 | 23.95 |
| 44755.364583333336 | 24.73 |
| 44755.375 | 24.31 |
| 44755.385416666664 | 25.2 |
| 44755.395833333336 | 24.38 |
| 44755.40625 | 24.25 |
| 44755.416666666664 | 27.19 |
| 44755.427083333336 | 29.01 |
| 44755.4375 | 29.51 |
| 44755.447916666664 | 30.29 |
| 44755.458333333336 | 34.23 |
| 44755.46875 | 34.22 |
| 44755.479166666664 | 31.88 |
| 44755.489583333336 | 32.2 |
| 44755.5 | 28.49 |
| 44755.510416666664 | 24.08 |
| 44755.520833333336 | 20.65 |
| 44755.53125 | 18.23 |
| 44755.541666666664 | 20.33 |
| 44755.552083333336 | 17.16 |
| 44755.5625 | 16.82 |
| 44755.572916666664 | 15.93 |
| 44755.583333333336 | 17.78 |
| 44755.59375 | 20.98 |
| 44755.604166666664 | 24.62 |
| 44755.614583333336 | 27.47 |
| 44755.625 | 35.71 |
| 44755.635416666664 | 32.02 |
| 44755.645833333336 | 36.27 |
| 44755.65625 | 33.22 |
| 44755.666666666664 | 33.7 |
| 44755.677083333336 | 33.13 |
| 44755.6875 | 31.67 |
| 44755.697916666664 | 33.02 |
| 44755.708333333336 | 32.48 |
| 44755.71875 | 30.87 |
| 44755.729166666664 | 29.14 |
| 44755.739583333336 | 28.94 |
| 44755.75 | 32.5 |
| 44755.760416666664 | 27.92 |
| 44755.770833333336 | 27.65 |
| 44755.78125 | 23.24 |
| 44755.791666666664 | 24.77 |
| 44755.802083333336 | 27.4 |
| 44755.8125 | 28.29 |
| 44755.822916666664 | 27.58 |
| 44755.833333333336 | 29.37 |
| 44755.84375 | 32.98 |
| 44755.854166666664 | 35.73 |
| 44755.864583333336 | 36.46 |
| 44755.875 | 38.31 |
| 44755.885416666664 | 37.96 |
| 44755.895833333336 | 38.31 |
| 44755.90625 | 39.01 |
| 44755.916666666664 | 41.53 |
| 44755.927083333336 | 43.53 |
| 44755.9375 | 47.57 |
| 44755.947916666664 | 46.65 |
| 44755.958333333336 | 51.48 |
| 44755.96875 | 47.63 |
| 44755.979166666664 | 43.15 |
| 44755.989583333336 | 40.42 |
| 44756.0 | 38.13 |
| 44756.010416666664 | 33.87 |
| 44756.020833333336 | 33.43 |
| 44756.03125 | 30.96 |
| 44756.041666666664 | 27.61 |
| 44756.052083333336 | 24.48 |
| 44756.0625 | 20.41 |
| 44756.072916666664 | 21.8 |
| 44756.083333333336 | 17.35 |
| 44756.09375 | 17.96 |
| 44756.104166666664 | 16.41 |
| 44756.114583333336 | 17.82 |
| 44756.125 | 19.47 |
| 44756.135416666664 | 16.72 |
| 44756.145833333336 | 17.56 |
| 44756.15625 | 17.94 |
| 44756.166666666664 | 18.49 |
| 44756.177083333336 | 22.04 |
| 44756.1875 | 22.65 |
| 44756.197916666664 | 28.93 |
| 44756.208333333336 | 30.04 |
| 44756.21875 | 30.79 |
| 44756.229166666664 | 35.11 |
| 44756.239583333336 | 40.39 |
| 44756.25 | 42.73 |
| 44756.260416666664 | 44.9 |
| 44756.270833333336 | 51.39 |
| 44756.28125 | 44.32 |
| 44756.291666666664 | 44.92 |
| 44756.302083333336 | 36.95 |
| 44756.3125 | 33.87 |
| 44756.322916666664 | 30.08 |
| 44756.333333333336 | 20.82 |
| 44756.34375 | 19.1 |
| 44756.354166666664 | 22.08 |
| 44756.364583333336 | 24.27 |
| 44756.375 | 24.92 |
| 44756.385416666664 | 24.5 |
| 44756.395833333336 | 30.31 |
| 44756.40625 | 36.54 |
| 44756.416666666664 | 35.83 |
| 44756.427083333336 | 37.61 |
| 44756.4375 | 40.76 |
| 44756.447916666664 | 38.73 |
| 44756.458333333336 | 37.11 |
| 44756.46875 | 37.52 |
| 44756.479166666664 | 36.68 |
| 44756.489583333336 | 37.21 |
| 44756.5 | 36.98 |
| 44756.510416666664 | 31.86 |
| 44756.520833333336 | 32.85 |
| 44756.53125 | 31.69 |
| 44756.541666666664 | 29.53 |
| 44756.552083333336 | 26.79 |
| 44756.5625 | 22.82 |
| 44756.572916666664 | 21.23 |
| 44756.583333333336 | 19.3 |
| 44756.59375 | 19.18 |
| 44756.604166666664 | 18.55 |
| 44756.614583333336 | 17.53 |
| 44756.625 | 19.39 |
| 44756.635416666664 | 19.87 |
| 44756.645833333336 | 22.96 |
| 44756.65625 | 36.16 |
| 44756.666666666664 | 31.84 |
| 44756.677083333336 | 35.17 |
| 44756.6875 | 35.38 |
| 44756.697916666664 | 41.79 |
| 44756.708333333336 | 42.66 |
| 44756.71875 | 41.46 |
| 44756.729166666664 | 41.96 |
| 44756.739583333336 | 36.74 |
| 44756.75 | 33.75 |
| 44756.760416666664 | 34.27 |
| 44756.770833333336 | 30.77 |
| 44756.78125 | 34.74 |
| 44756.791666666664 | 34.52 |
| 44756.802083333336 | 27.31 |
| 44756.8125 | 33.92 |
| 44756.822916666664 | 28.78 |
| 44756.833333333336 | 23.37 |
| 44756.84375 | 26.29 |
| 44756.854166666664 | 30.32 |
| 44756.864583333336 | 30.25 |
| 44756.875 | 30.59 |
| 44756.885416666664 | 34.22 |
| 44756.895833333336 | 43.19 |
| 44756.90625 | 48.15 |
| 44756.916666666664 | 44.33 |
| 44756.927083333336 | 43.7 |
| 44756.9375 | 44.11 |
| 44756.947916666664 | 46.27 |
| 44756.958333333336 | 49.49 |
| 44756.96875 | 47.25 |
| 44756.979166666664 | 50.46 |
| 44756.989583333336 | 50.05 |
| 44757.0 | 47.28 |
| 44757.010416666664 | 46.33 |
| 44757.020833333336 | 42.26 |
| 44757.03125 | 39.13 |
| 44757.041666666664 | 34.4 |
| 44757.052083333336 | 31.59 |
| 44757.0625 | 30.3 |
| 44757.072916666664 | 26.22 |
| 44757.083333333336 | 23.83 |
| 44757.09375 | 20.82 |
| 44757.104166666664 | 19.19 |
| 44757.114583333336 | 16.58 |
| 44757.125 | 18.07 |
| 44757.135416666664 | 18.44 |
| 44757.145833333336 | 16.07 |
| 44757.15625 | 16.23 |
| 44757.166666666664 | 15.95 |
| 44757.177083333336 | 15.97 |
| 44757.1875 | 17.22 |
| 44757.197916666664 | 17.59 |
| 44757.208333333336 | 24.98 |
| 44757.21875 | 19.95 |
| 44757.229166666664 | 25.48 |
| 44757.239583333336 | 34.16 |
| 44757.25 | 32.96 |
| 44757.260416666664 | 36.45 |
| 44757.270833333336 | 36.07 |
| 44757.28125 | 46.34 |
| 44757.291666666664 | 56 |
| 44757.302083333336 | 48.49 |
| 44757.3125 | 45.96 |
| 44757.322916666664 | 40.05 |
| 44757.333333333336 | 37.04 |
| 44757.34375 | 36.94 |
| 44757.354166666664 | 23.19 |
| 44757.364583333336 | 18.38 |
| 44757.375 | 20.29 |
| 44757.385416666664 | 18.21 |
| 44757.395833333336 | 21.09 |
| 44757.40625 | 22.89 |
| 44757.416666666664 | 24.35 |
| 44757.427083333336 | 31.09 |
| 44757.4375 | 30.92 |
| 44757.447916666664 | 36.4 |
| 44757.458333333336 | 35.02 |
| 44757.46875 | 38.17 |
| 44757.479166666664 | 37.52 |
| 44757.489583333336 | 35.3 |
| 44757.5 | 34.8 |
| 44757.510416666664 | 34.62 |
| 44757.520833333336 | 36.94 |
| 44757.53125 | 31.76 |
| 44757.541666666664 | 35.82 |
| 44757.552083333336 | 34.76 |
| 44757.5625 | 32.47 |
| 44757.572916666664 | 29.66 |
| 44757.583333333336 | 26.33 |
| 44757.59375 | 23.58 |
| 44757.604166666664 | 20.84 |
| 44757.614583333336 | 18.71 |
| 44757.625 | 17.57 |
| 44757.635416666664 | 18.42 |
| 44757.645833333336 | 16.75 |
| 44757.65625 | 15.08 |
| 44757.666666666664 | 20.74 |
| 44757.677083333336 | 21.22 |
| 44757.6875 | 22.76 |
| 44757.697916666664 | 24.05 |
| 44757.708333333336 | 25.89 |
| 44757.71875 | 32.41 |
| 44757.729166666664 | 28.54 |
| 44757.739583333336 | 38.42 |
| 44757.75 | 47.21 |
| 44757.760416666664 | 44.23 |
| 44757.770833333336 | 43.42 |
| 44757.78125 | 36.97 |
| 44757.791666666664 | 41.6 |
| 44757.802083333336 | 63.95 |
| 44757.8125 | 44.65 |
| 44757.822916666664 | 46.27 |
| 44757.833333333336 | 57.6 |
| 44757.84375 | 46.38 |
| 44757.854166666664 | 42.3 |
| 44757.864583333336 | 35.43 |
| 44757.875 | 34.89 |
| 44757.885416666664 | 30.04 |
| 44757.895833333336 | 36.19 |
| 44757.90625 | 34.92 |
| 44757.916666666664 | 34.42 |
| 44757.927083333336 | 34.29 |
| 44757.9375 | 36.64 |
| 44757.947916666664 | 37.2 |
| 44757.958333333336 | 37.54 |
| 44757.96875 | 34.46 |
| 44757.979166666664 | 30.56 |
| 44757.989583333336 | 27.82 |
| 44758.0 | 27.21 |
| 44758.010416666664 | 33.76 |
| 44758.020833333336 | 29.04 |
| 44758.03125 | 32.82 |
| 44758.041666666664 | 31.34 |
| 44758.052083333336 | 31.61 |
| 44758.0625 | 29.44 |
| 44758.072916666664 | 26.01 |
| 44758.083333333336 | 24.7 |
| 44758.09375 | 21.77 |
| 44758.104166666664 | 19.66 |
| 44758.114583333336 | 19.34 |
| 44758.125 | 18.04 |
| 44758.135416666664 | 15.58 |
| 44758.145833333336 | 15.02 |
| 44758.15625 | 12.79 |
| 44758.166666666664 | 14.56 |
| 44758.177083333336 | 13.45 |
| 44758.1875 | 12.69 |
| 44758.197916666664 | 15.74 |
| 44758.208333333336 | 17.76 |
| 44758.21875 | 18.81 |
| 44758.229166666664 | 19.87 |
| 44758.239583333336 | 16.75 |
| 44758.25 | 23.93 |
| 44758.260416666664 | 24.86 |
| 44758.270833333336 | 26.13 |
| 44758.28125 | 31.22 |
| 44758.291666666664 | 38.29 |
| 44758.302083333336 | 40.01 |
| 44758.3125 | 41.34 |
| 44758.322916666664 | 44.5 |
| 44758.333333333336 | 52.11 |
| 44758.34375 | 44.32 |
| 44758.354166666664 | 36.85 |
| 44758.364583333336 | 29.72 |
| 44758.375 | 28.61 |
| 44758.385416666664 | 21.91 |
| 44758.395833333336 | 16.66 |
| 44758.40625 | 16.39 |
| 44758.416666666664 | 14.52 |
| 44758.427083333336 | 21.65 |
| 44758.4375 | 24.69 |
| 44758.447916666664 | 23.85 |
| 44758.458333333336 | 25.58 |
| 44758.46875 | 27.01 |
| 44758.479166666664 | 30.84 |
| 44758.489583333336 | 34.04 |
| 44758.5 | 31.62 |
| 44758.510416666664 | 31.01 |
| 44758.520833333336 | 30.74 |
| 44758.53125 | 28.83 |
| 44758.541666666664 | 29.29 |
| 44758.552083333336 | 30.41 |
| 44758.5625 | 27.95 |
| 44758.572916666664 | 34.81 |
| 44758.583333333336 | 25.07 |
| 44758.59375 | 22.35 |
| 44758.604166666664 | 23.52 |
| 44758.614583333336 | 20.41 |
| 44758.625 | 20.12 |
| 44758.635416666664 | 20.08 |
| 44758.645833333336 | 17.42 |
| 44758.65625 | 14.16 |
| 44758.666666666664 | 15.14 |
| 44758.677083333336 | 12.55 |
| 44758.6875 | 14.35 |
| 44758.697916666664 | 14.99 |
| 44758.708333333336 | 15.54 |
| 44758.71875 | 18.02 |
| 44758.729166666664 | 19.97 |
| 44758.739583333336 | 28.47 |
| 44758.75 | 24.65 |
| 44758.760416666664 | 25.52 |
| 44758.770833333336 | 25.02 |
| 44758.78125 | 28.11 |
| 44758.791666666664 | 30.58 |
| 44758.802083333336 | 33 |
| 44758.8125 | 37.19 |
| 44758.822916666664 | 31.84 |
| 44758.833333333336 | 38.27 |
| 44758.84375 | 35.97 |
| 44758.854166666664 | 32.92 |
| 44758.864583333336 | 28.88 |
| 44758.875 | 24.64 |
| 44758.885416666664 | 22.71 |
| 44758.895833333336 | 20.82 |
| 44758.90625 | 20.18 |
| 44758.916666666664 | 18.18 |
| 44758.927083333336 | 21.91 |
| 44758.9375 | 28.28 |
| 44758.947916666664 | 27.35 |
| 44758.958333333336 | 29.65 |
| 44758.96875 | 31.38 |
| 44758.979166666664 | 34.36 |
| 44758.989583333336 | 39.71 |
| 44759.0 | 37.29 |
| 44759.010416666664 | 39.63 |
| 44759.020833333336 | 43.76 |
| 44759.03125 | 48.46 |
| 44759.041666666664 | 43.6 |
| 44759.052083333336 | 44.23 |
| 44759.0625 | 40.16 |
| 44759.072916666664 | 37.22 |
| 44759.083333333336 | 37.19 |
| 44759.09375 | 32.28 |
| 44759.104166666664 | 29.34 |
| 44759.114583333336 | 27.38 |
| 44759.125 | 23.56 |
| 44759.135416666664 | 20.6 |
| 44759.145833333336 | 26.15 |
| 44759.15625 | 17.61 |
| 44759.166666666664 | 17.8 |
| 44759.177083333336 | 15.91 |
| 44759.1875 | 15.26 |
| 44759.197916666664 | 32.27 |
| 44759.208333333336 | 13.95 |
| 44759.21875 | 15.05 |
| 44759.229166666664 | 15.81 |
| 44759.239583333336 | 14.77 |
| 44759.25 | 18.3 |
| 44759.260416666664 | 24.32 |
| 44759.270833333336 | 22.73 |
| 44759.28125 | 23.64 |
| 44759.291666666664 | 24.57 |
| 44759.302083333336 | 29.36 |
| 44759.3125 | 31.43 |
| 44759.322916666664 | 37.31 |
| 44759.333333333336 | 36.47 |
| 44759.34375 | 41.48 |
| 44759.354166666664 | 41.99 |
| 44759.364583333336 | 46.05 |
| 44759.375 | 41.19 |
| 44759.385416666664 | 33.47 |
| 44759.395833333336 | 29.08 |
| 44759.40625 | 25.55 |
| 44759.416666666664 | 20.38 |
| 44759.427083333336 | 19.28 |
| 44759.4375 | 16.9 |
| 44759.447916666664 | 15 |
| 44759.458333333336 | 19.51 |
| 44759.46875 | 23.75 |
| 44759.479166666664 | 21.76 |
| 44759.489583333336 | 25.44 |
| 44759.5 | 25.29 |
| 44759.510416666664 | 34.28 |
| 44759.520833333336 | 29.72 |
| 44759.53125 | 29.99 |
| 44759.541666666664 | 29.07 |
| 44759.552083333336 | 28.17 |
| 44759.5625 | 28.79 |
| 44759.572916666664 | 28.19 |
| 44759.583333333336 | 29.82 |
| 44759.59375 | 28.99 |
| 44759.604166666664 | 29.87 |
| 44759.614583333336 | 27.47 |
| 44759.625 | 24.77 |
| 44759.635416666664 | 23.76 |
| 44759.645833333336 | 23.54 |
| 44759.65625 | 21.47 |
| 44759.666666666664 | 21.9 |
| 44759.677083333336 | 17.86 |
| 44759.6875 | 18.51 |
| 44759.697916666664 | 17.19 |
| 44759.708333333336 | 15.78 |
| 44759.71875 | 14.57 |
| 44759.729166666664 | 16.03 |
| 44759.739583333336 | 19.36 |
| 44759.75 | 17.54 |
| 44759.760416666664 | 19.98 |
| 44759.770833333336 | 22.5 |
| 44759.78125 | 23.75 |
| 44759.791666666664 | 25.9 |
| 44759.802083333336 | 26.4 |
| 44759.8125 | 26.16 |
| 44759.822916666664 | 26.58 |
| 44759.833333333336 | 28 |
| 44759.84375 | 31.44 |
| 44759.854166666664 | 31.74 |
| 44759.864583333336 | 32.07 |
| 44759.875 | 38.39 |
| 44759.885416666664 | 31.88 |
| 44759.895833333336 | 28.91 |
| 44759.90625 | 28.76 |
| 44759.916666666664 | 22.78 |
| 44759.927083333336 | 20.84 |
| 44759.9375 | 20.08 |
| 44759.947916666664 | 19.27 |
| 44759.958333333336 | 20.91 |
| 44759.96875 | 27.16 |
| 44759.979166666664 | 27.26 |
| 44759.989583333336 | 29.17 |
| 44760.0 | 29 |
| 44760.010416666664 | 33.06 |
| 44760.020833333336 | 35.17 |
| 44760.03125 | 37.94 |
| 44760.041666666664 | 38.2 |
| 44760.052083333336 | 41.29 |
| 44760.0625 | 45.65 |
| 44760.072916666664 | 41.95 |
| 44760.083333333336 | 41.42 |
| 44760.09375 | 40.78 |
| 44760.104166666664 | 34.16 |
| 44760.114583333336 | 33.41 |
| 44760.125 | 31.9 |
| 44760.135416666664 | 31.66 |
| 44760.145833333336 | 29.4 |
| 44760.15625 | 24.27 |
| 44760.166666666664 | 21.73 |
| 44760.177083333336 | 24.22 |
| 44760.1875 | 21.02 |
| 44760.197916666664 | 19.39 |
| 44760.208333333336 | 20.11 |
| 44760.21875 | 17.51 |
| 44760.229166666664 | 14.61 |
| 44760.239583333336 | 14.79 |
| 44760.25 | 15.42 |
| 44760.260416666664 | 15.03 |
| 44760.270833333336 | 19.48 |
| 44760.28125 | 18.05 |
| 44760.291666666664 | 19.95 |
| 44760.302083333336 | 22.72 |
| 44760.3125 | 28.77 |
| 44760.322916666664 | 29.03 |
| 44760.333333333336 | 22.9 |
| 44760.34375 | 28.92 |
| 44760.354166666664 | 28 |
| 44760.364583333336 | 29.35 |
| 44760.375 | 24.85 |
| 44760.385416666664 | 27.97 |
| 44760.395833333336 | 25.6 |
| 44760.40625 | 26.41 |
| 44760.416666666664 | 30.79 |
| 44760.427083333336 | 23.2 |
| 44760.4375 | 19.82 |
| 44760.447916666664 | 20.23 |
| 44760.458333333336 | 20.13 |
| 44760.46875 | 20.74 |
| 44760.479166666664 | 17.93 |
| 44760.489583333336 | 21.68 |
| 44760.5 | 26.74 |
| 44760.510416666664 | 24.7 |
| 44760.520833333336 | 26.81 |
| 44760.53125 | 28.93 |
| 44760.541666666664 | 31.42 |
| 44760.552083333336 | 36.27 |
| 44760.5625 | 37.14 |
| 44760.572916666664 | 39.75 |
| 44760.583333333336 | 45.26 |
| 44760.59375 | 42.13 |
| 44760.604166666664 | 37.26 |
| 44760.614583333336 | 38.14 |
| 44760.625 | 36.89 |
| 44760.635416666664 | 36.12 |
| 44760.645833333336 | 32.89 |
| 44760.65625 | 33.23 |
| 44760.666666666664 | 33.51 |
| 44760.677083333336 | 35.7 |
| 44760.6875 | 31.66 |
| 44760.697916666664 | 29.03 |
| 44760.708333333336 | 26.95 |
| 44760.71875 | 23.39 |
| 44760.729166666664 | 23.62 |
| 44760.739583333336 | 20.14 |
| 44760.75 | 19.62 |
| 44760.760416666664 | 15.14 |
| 44760.770833333336 | 15.54 |
| 44760.78125 | 18.88 |
| 44760.791666666664 | 20.3 |
| 44760.802083333336 | 25.23 |
| 44760.8125 | 24.94 |
| 44760.822916666664 | 26.22 |
| 44760.833333333336 | 25.2 |
| 44760.84375 | 27.66 |
| 44760.854166666664 | 27.42 |
| 44760.864583333336 | 28.84 |
| 44760.875 | 31.49 |
| 44760.885416666664 | 34.29 |
| 44760.895833333336 | 40.57 |
| 44760.90625 | 32.67 |
| 44760.916666666664 | 35.18 |
| 44760.927083333336 | 32.67 |
| 44760.9375 | 27.71 |
| 44760.947916666664 | 24.62 |
| 44760.958333333336 | 23.62 |
| 44760.96875 | 25.79 |
| 44760.979166666664 | 22.94 |
| 44760.989583333336 | 22.33 |
| 44761.0 | 24.42 |
| 44761.010416666664 | 32.54 |
| 44761.020833333336 | 30.16 |
| 44761.03125 | 29.99 |
| 44761.041666666664 | 30.68 |
| 44761.052083333336 | 35.15 |
| 44761.0625 | 34.56 |
| 44761.072916666664 | 36.56 |
| 44761.083333333336 | 36.32 |
| 44761.09375 | 36.16 |
| 44761.104166666664 | 39.18 |
| 44761.114583333336 | 39.4 |
| 44761.125 | 36.55 |
| 44761.135416666664 | 35.86 |
| 44761.145833333336 | 35.69 |
| 44761.15625 | 35.13 |
| 44761.166666666664 | 33.97 |
| 44761.177083333336 | 31.85 |
| 44761.1875 | 30.23 |
| 44761.197916666664 | 28.26 |
| 44761.208333333336 | 26.59 |
| 44761.21875 | 25.39 |
| 44761.229166666664 | 22.66 |
| 44761.239583333336 | 21.17 |
| 44761.25 | 18.87 |
| 44761.260416666664 | 17.49 |
| 44761.270833333336 | 16.3 |
| 44761.28125 | 16.67 |
| 44761.291666666664 | 15.5 |
| 44761.302083333336 | 14.94 |
| 44761.3125 | 23.32 |
| 44761.322916666664 | 24.87 |
| 44761.333333333336 | 31.07 |
| 44761.34375 | 29.82 |
| 44761.354166666664 | 28.51 |
| 44761.364583333336 | 31.57 |
| 44761.375 | 37.27 |
| 44761.385416666664 | 30.22 |
| 44761.395833333336 | 31.98 |
| 44761.40625 | 29.78 |
| 44761.416666666664 | 29.49 |
| 44761.427083333336 | 29.47 |
| 44761.4375 | 27.8 |
| 44761.447916666664 | 28.65 |
| 44761.458333333336 | 23.42 |
| 44761.46875 | 23.36 |
| 44761.479166666664 | 21.8 |
| 44761.489583333336 | 19.38 |
| 44761.5 | 21.85 |
| 44761.510416666664 | 20.47 |
| 44761.520833333336 | 20.24 |
| 44761.53125 | 23.96 |
| 44761.541666666664 | 25.99 |
| 44761.552083333336 | 25.34 |
| 44761.5625 | 24.96 |
| 44761.572916666664 | 29.89 |
| 44761.583333333336 | 32.94 |
| 44761.59375 | 31.59 |
| 44761.604166666664 | 33.03 |
| 44761.614583333336 | 34.22 |
| 44761.625 | 34.37 |
| 44761.635416666664 | 33.23 |
| 44761.645833333336 | 33.24 |
| 44761.65625 | 35.04 |
| 44761.666666666664 | 33.31 |
| 44761.677083333336 | 32.53 |
| 44761.6875 | 30.22 |
| 44761.697916666664 | 29.74 |
| 44761.708333333336 | 28.18 |
| 44761.71875 | 27.29 |
| 44761.729166666664 | 24.61 |
| 44761.739583333336 | 21.8 |
| 44761.75 | 18.35 |
| 44761.760416666664 | 17.52 |
| 44761.770833333336 | 18.62 |
| 44761.78125 | 22.01 |
| 44761.791666666664 | 16.49 |
| 44761.802083333336 | 14.93 |
| 44761.8125 | 17.01 |
| 44761.822916666664 | 16.19 |
| 44761.833333333336 | 19.92 |
| 44761.84375 | 22.56 |
| 44761.854166666664 | 23.96 |
| 44761.864583333336 | 28.84 |
| 44761.875 | 28.28 |
| 44761.885416666664 | 26.63 |
| 44761.895833333336 | 27 |
| 44761.90625 | 33.12 |
| 44761.916666666664 | 37.96 |
| 44761.927083333336 | 34.72 |
| 44761.9375 | 33.46 |
| 44761.947916666664 | 33.19 |
| 44761.958333333336 | 30 |
| 44761.96875 | 29.31 |
| 44761.979166666664 | 25.03 |
| 44761.989583333336 | 21.15 |
| 44762.0 | 22.81 |
| 44762.010416666664 | 19.96 |
| 44762.020833333336 | 18.19 |
| 44762.03125 | 19.08 |
| 44762.041666666664 | 18.78 |
| 44762.052083333336 | 22.18 |
| 44762.0625 | 22.7 |
| 44762.072916666664 | 23.27 |
| 44762.083333333336 | 23.41 |
| 44762.09375 | 23.96 |
| 44762.104166666664 | 25.3 |
| 44762.114583333336 | 24.87 |
| 44762.125 | 27.18 |
| 44762.135416666664 | 24.06 |
| 44762.145833333336 | 24.31 |
| 44762.15625 | 24.71 |
| 44762.166666666664 | 23.29 |
| 44762.177083333336 | 23.45 |
| 44762.1875 | 22.96 |
| 44762.197916666664 | 22.76 |
| 44762.208333333336 | 22.49 |
| 44762.21875 | 21.28 |
| 44762.229166666664 | 20.74 |
| 44762.239583333336 | 19.58 |
| 44762.25 | 18.62 |
| 44762.260416666664 | 16.98 |
| 44762.270833333336 | 17.96 |
| 44762.28125 | 17.38 |
| 44762.291666666664 | 16.27 |
| 44762.302083333336 | 16.41 |
| 44762.3125 | 15.96 |
| 44762.322916666664 | 17.3 |
| 44762.333333333336 | 18.39 |
| 44762.34375 | 19.73 |
| 44762.354166666664 | 19.37 |
| 44762.364583333336 | 21.76 |
| 44762.375 | 29.78 |
| 44762.385416666664 | 26.27 |
| 44762.395833333336 | 27.61 |
| 44762.40625 | 24.94 |
| 44762.416666666664 | 33.06 |
| 44762.427083333336 | 25.73 |
| 44762.4375 | 26.57 |
| 44762.447916666664 | 25.93 |
| 44762.458333333336 | 23.8 |
| 44762.46875 | 22.68 |
| 44762.479166666664 | 21.06 |
| 44762.489583333336 | 21.79 |
| 44762.5 | 23.59 |
| 44762.510416666664 | 21.86 |
| 44762.520833333336 | 20.26 |
| 44762.53125 | 20.32 |
| 44762.541666666664 | 20.59 |
| 44762.552083333336 | 25.71 |
| 44762.5625 | 24.67 |
| 44762.572916666664 | 24.88 |
| 44762.583333333336 | 25.35 |
| 44762.59375 | 25.17 |
| 44762.604166666664 | 25.77 |
| 44762.614583333336 | 27.14 |
| 44762.625 | 25.77 |
| 44762.635416666664 | 27.18 |
| 44762.645833333336 | 29.15 |
| 44762.65625 | 24.36 |
| 44762.666666666664 | 25.28 |
| 44762.677083333336 | 23.73 |
| 44762.6875 | 24.69 |
| 44762.697916666664 | 23.24 |
| 44762.708333333336 | 23.88 |
| 44762.71875 | 23.01 |
| 44762.729166666664 | 25.17 |
| 44762.739583333336 | 23.3 |
| 44762.75 | 23.82 |
| 44762.760416666664 | 21.42 |
| 44762.770833333336 | 20.92 |
| 44762.78125 | 19.81 |
| 44762.791666666664 | 19.67 |
| 44762.802083333336 | 18.54 |
| 44762.8125 | 17.4 |
| 44762.822916666664 | 15.82 |
| 44762.833333333336 | 14.36 |
| 44762.84375 | 18.09 |
| 44762.854166666664 | 18.67 |
| 44762.864583333336 | 18.67 |
| 44762.875 | 21.24 |
| 44762.885416666664 | 21.71 |
| 44762.895833333336 | 28.22 |
| 44762.90625 | 22.98 |
| 44762.916666666664 | 23.39 |
| 44762.927083333336 | 22.26 |
| 44762.9375 | 23.78 |
| 44762.947916666664 | 26.13 |
| 44762.958333333336 | 27.93 |
| 44762.96875 | 28.9 |
| 44762.979166666664 | 29.95 |
| 44762.989583333336 | 28.78 |
| 44763.0 | 26.9 |
| 44763.010416666664 | 25.75 |
| 44763.020833333336 | 23.24 |
| 44763.03125 | 22.53 |
| 44763.041666666664 | 22.5 |
| 44763.052083333336 | 20.1 |
| 44763.0625 | 19.86 |
| 44763.072916666664 | 17.49 |
| 44763.083333333336 | 21.64 |
| 44763.09375 | 23.06 |
| 44763.104166666664 | 25.5 |
| 44763.114583333336 | 23.79 |
| 44763.125 | 22.23 |
| 44763.135416666664 | 22.57 |
| 44763.145833333336 | 25.3 |
| 44763.15625 | 22.88 |
| 44763.166666666664 | 25.66 |
| 44763.177083333336 | 25.53 |
| 44763.1875 | 25.41 |
| 44763.197916666664 | 27.06 |
| 44763.208333333336 | 25.95 |
| 44763.21875 | 26.13 |
| 44763.229166666664 | 25.08 |
| 44763.239583333336 | 24.32 |
| 44763.25 | 24.72 |
| 44763.260416666664 | 22.94 |
| 44763.270833333336 | 21.95 |
| 44763.28125 | 23.16 |
| 44763.291666666664 | 21.23 |
| 44763.302083333336 | 27.52 |
| 44763.3125 | 18.83 |
| 44763.322916666664 | 15.49 |
| 44763.333333333336 | 16.9 |
| 44763.34375 | 15.59 |
| 44763.354166666664 | 15.88 |
| 44763.364583333336 | 15.52 |
| 44763.375 | 16.23 |
| 44763.385416666664 | 19.01 |
| 44763.395833333336 | 21 |
| 44763.40625 | 23.8 |
| 44763.416666666664 | 26.45 |
| 44763.427083333336 | 27.46 |
| 44763.4375 | 25.47 |
| 44763.447916666664 | 26.67 |
| 44763.458333333336 | 24.17 |
| 44763.46875 | 25.29 |
| 44763.479166666664 | 23.24 |
| 44763.489583333336 | 21.05 |
| 44763.5 | 22.04 |
| 44763.510416666664 | 19.6 |
| 44763.520833333336 | 21.16 |
| 44763.53125 | 19.45 |
| 44763.541666666664 | 18.72 |
| 44763.552083333336 | 18.45 |
| 44763.5625 | 17.86 |
| 44763.572916666664 | 19.6 |
| 44763.583333333336 | 20.89 |
| 44763.59375 | 24.47 |
| 44763.604166666664 | 24.28 |
| 44763.614583333336 | 23.07 |
| 44763.625 | 25.08 |
| 44763.635416666664 | 25.01 |
| 44763.645833333336 | 27.37 |
| 44763.65625 | 27.75 |
| 44763.666666666664 | 29.57 |
| 44763.677083333336 | 29.51 |
| 44763.6875 | 34.85 |
| 44763.697916666664 | 35.39 |
| 44763.708333333336 | 35.31 |
| 44763.71875 | 37.01 |
| 44763.729166666664 | 36.05 |
| 44763.739583333336 | 38.85 |
| 44763.75 | 36.8 |
| 44763.760416666664 | 34.83 |
| 44763.770833333336 | 35.04 |
| 44763.78125 | 30.84 |
| 44763.791666666664 | 31 |
| 44763.802083333336 | 31.13 |
| 44763.8125 | 28.88 |
| 44763.822916666664 | 23.5 |
| 44763.833333333336 | 24.51 |
| 44763.84375 | 17.61 |
| 44763.854166666664 | 16.12 |
| 44763.864583333336 | 17.88 |
| 44763.875 | 21.38 |
| 44763.885416666664 | 17.62 |
| 44763.895833333336 | 19.56 |
| 44763.90625 | 19.58 |
| 44763.916666666664 | 22.06 |
| 44763.927083333336 | 28.87 |
| 44763.9375 | 27.3 |
| 44763.947916666664 | 39.48 |
| 44763.958333333336 | 38.68 |
| 44763.96875 | 36.83 |
| 44763.979166666664 | 35.57 |
| 44763.989583333336 | 38.14 |
| 44764.0 | 39.72 |
| 44764.010416666664 | 39.21 |
| 44764.020833333336 | 29.4 |
| 44764.03125 | 29.89 |
| 44764.041666666664 | 27.09 |
| 44764.052083333336 | 20.79 |
| 44764.0625 | 21.31 |
| 44764.072916666664 | 19.41 |
| 44764.083333333336 | 17.24 |
| 44764.09375 | 17.64 |
| 44764.104166666664 | 17.56 |
| 44764.114583333336 | 17.38 |
| 44764.125 | 20.88 |
| 44764.135416666664 | 24.47 |
| 44764.145833333336 | 26.61 |
| 44764.15625 | 28.4 |
| 44764.166666666664 | 28.97 |
| 44764.177083333336 | 27.39 |
| 44764.1875 | 27.82 |
| 44764.197916666664 | 28.49 |
| 44764.208333333336 | 28.01 |
| 44764.21875 | 26.47 |
| 44764.229166666664 | 23.63 |
| 44764.239583333336 | 23.44 |
| 44764.25 | 22.64 |
| 44764.260416666664 | 20.51 |
| 44764.270833333336 | 20.72 |
| 44764.28125 | 21.63 |
| 44764.291666666664 | 21.09 |
| 44764.302083333336 | 21.7 |
| 44764.3125 | 21.53 |
| 44764.322916666664 | 19.5 |
| 44764.333333333336 | 19.97 |
| 44764.34375 | 16.44 |
| 44764.354166666664 | 16.41 |
| 44764.364583333336 | 20.04 |
| 44764.375 | 17.88 |
| 44764.385416666664 | 16.59 |
| 44764.395833333336 | 20.63 |
| 44764.40625 | 18.62 |
| 44764.416666666664 | 21.92 |
| 44764.427083333336 | 22.33 |
| 44764.4375 | 20.95 |
| 44764.447916666664 | 22.48 |
| 44764.458333333336 | 25.16 |
| 44764.46875 | 28.45 |
| 44764.479166666664 | 28.59 |
| 44764.489583333336 | 29.64 |
| 44764.5 | 29.94 |
| 44764.510416666664 | 28.69 |
| 44764.520833333336 | 27.57 |
| 44764.53125 | 23.52 |
| 44764.541666666664 | 23.07 |
| 44764.552083333336 | 22.15 |
| 44764.5625 | 24.53 |
| 44764.572916666664 | 23.75 |
| 44764.583333333336 | 22.36 |
| 44764.59375 | 25.88 |
| 44764.604166666664 | 19.6 |
| 44764.614583333336 | 20.89 |
| 44764.625 | 23.08 |
| 44764.635416666664 | 24.11 |
| 44764.645833333336 | 23.95 |
| 44764.65625 | 25.55 |
| 44764.666666666664 | 26.78 |
| 44764.677083333336 | 28 |
| 44764.6875 | 35.95 |
| 44764.697916666664 | 26.76 |
| 44764.708333333336 | 27.56 |
| 44764.71875 | 26.66 |
| 44764.729166666664 | 26.21 |
| 44764.739583333336 | 25.97 |
| 44764.75 | 28.53 |
| 44764.760416666664 | 26.77 |
| 44764.770833333336 | 26.1 |
| 44764.78125 | 28.22 |
| 44764.791666666664 | 24.48 |
| 44764.802083333336 | 23.65 |
| 44764.8125 | 24.84 |
| 44764.822916666664 | 22.84 |
| 44764.833333333336 | 23.57 |
| 44764.84375 | 21.28 |
| 44764.854166666664 | 22.51 |
| 44764.864583333336 | 22.11 |
| 44764.875 | 19.93 |
| 44764.885416666664 | 21.22 |
| 44764.895833333336 | 18.77 |
| 44764.90625 | 17.16 |
| 44764.916666666664 | 16.83 |
| 44764.927083333336 | 15.2 |
| 44764.9375 | 16.56 |
| 44764.947916666664 | 17.48 |
| 44764.958333333336 | 22.42 |
| 44764.96875 | 21.4 |
| 44764.979166666664 | 29.07 |
| 44764.989583333336 | 35.92 |
| 44765.0 | 28.41 |
| 44765.010416666664 | 27.29 |
| 44765.020833333336 | 29.91 |
| 44765.03125 | 31.49 |
| 44765.041666666664 | 32.44 |
| 44765.052083333336 | 27.25 |
| 44765.0625 | 25.92 |
| 44765.072916666664 | 25.01 |
| 44765.083333333336 | 20.13 |
| 44765.09375 | 18.1 |
| 44765.104166666664 | 16.86 |
| 44765.114583333336 | 16.08 |
| 44765.125 | 15.21 |
| 44765.135416666664 | 14.74 |
| 44765.145833333336 | 15.75 |
| 44765.15625 | 15.92 |
| 44765.166666666664 | 19.79 |
| 44765.177083333336 | 21.22 |
| 44765.1875 | 21.03 |
| 44765.197916666664 | 20.39 |
| 44765.208333333336 | 22.05 |
| 44765.21875 | 21.03 |
| 44765.229166666664 | 21.94 |
| 44765.239583333336 | 21.75 |
| 44765.25 | 21.09 |
| 44765.260416666664 | 21.76 |
| 44765.270833333336 | 22.25 |
| 44765.28125 | 20.75 |
| 44765.291666666664 | 20.92 |
| 44765.302083333336 | 20.3 |
| 44765.3125 | 20.76 |
| 44765.322916666664 | 19.83 |
| 44765.333333333336 | 19.23 |
| 44765.34375 | 20.62 |
| 44765.354166666664 | 18.42 |
| 44765.364583333336 | 17.39 |
| 44765.375 | 17.78 |
| 44765.385416666664 | 17.12 |
| 44765.395833333336 | 15.18 |
| 44765.40625 | 16.87 |
| 44765.416666666664 | 17.45 |
| 44765.427083333336 | 17.39 |
| 44765.4375 | 18.91 |
| 44765.447916666664 | 19.33 |
| 44765.458333333336 | 20.46 |
| 44765.46875 | 21.28 |
| 44765.479166666664 | 24.95 |
| 44765.489583333336 | 27.79 |
| 44765.5 | 22.19 |
| 44765.510416666664 | 28.51 |
| 44765.520833333336 | 23.34 |
| 44765.53125 | 22.57 |
| 44765.541666666664 | 22.51 |
| 44765.552083333336 | 25.43 |
| 44765.5625 | 22.76 |
| 44765.572916666664 | 21.28 |
| 44765.583333333336 | 23.99 |
| 44765.59375 | 23.07 |
| 44765.604166666664 | 21.79 |
| 44765.614583333336 | 22.55 |
| 44765.625 | 23.72 |
| 44765.635416666664 | 28.73 |
| 44765.645833333336 | 17.75 |
| 44765.65625 | 17.65 |
| 44765.666666666664 | 19.8 |
| 44765.677083333336 | 21.12 |
| 44765.6875 | 22.02 |
| 44765.697916666664 | 21.36 |
| 44765.708333333336 | 22.39 |
| 44765.71875 | 22.37 |
| 44765.729166666664 | 23.49 |
| 44765.739583333336 | 23.63 |
| 44765.75 | 23.77 |
| 44765.760416666664 | 23.94 |
| 44765.770833333336 | 22.51 |
| 44765.78125 | 24.34 |
| 44765.791666666664 | 23.98 |
| 44765.802083333336 | 21.7 |
| 44765.8125 | 21.12 |
| 44765.822916666664 | 21.13 |
| 44765.833333333336 | 21.81 |
| 44765.84375 | 21.71 |
| 44765.854166666664 | 25.54 |
| 44765.864583333336 | 22.36 |
| 44765.875 | 20.98 |
| 44765.885416666664 | 24.76 |
| 44765.895833333336 | 22.52 |
| 44765.90625 | 21.53 |
| 44765.916666666664 | 19.69 |
| 44765.927083333336 | 18.21 |
| 44765.9375 | 16.62 |
| 44765.947916666664 | 18.17 |
| 44765.958333333336 | 16.68 |
| 44765.96875 | 14.7 |
| 44765.979166666664 | 17.66 |
| 44765.989583333336 | 18.19 |
| 44766.0 | 21.98 |
| 44766.010416666664 | 25.93 |
| 44766.020833333336 | 29.75 |
| 44766.03125 | 24.78 |
| 44766.041666666664 | 28.54 |
| 44766.052083333336 | 28.28 |
| 44766.0625 | 27.02 |
| 44766.072916666664 | 26.72 |
| 44766.083333333336 | 26.03 |
| 44766.09375 | 27.14 |
| 44766.104166666664 | 22.17 |
| 44766.114583333336 | 22.56 |
| 44766.125 | 21.14 |
| 44766.135416666664 | 18.88 |
| 44766.145833333336 | 18.3 |
| 44766.15625 | 17.19 |
| 44766.166666666664 | 15.7 |
| 44766.177083333336 | 15.65 |
| 44766.1875 | 15.63 |
| 44766.197916666664 | 17.2 |
| 44766.208333333336 | 20.36 |
| 44766.21875 | 22.57 |
| 44766.229166666664 | 20.27 |
| 44766.239583333336 | 21.18 |
| 44766.25 | 20.61 |
| 44766.260416666664 | 22.12 |
| 44766.270833333336 | 21.62 |
| 44766.28125 | 21.44 |
| 44766.291666666664 | 22.43 |
| 44766.302083333336 | 21.5 |
| 44766.3125 | 20.67 |
| 44766.322916666664 | 20.36 |
| 44766.333333333336 | 20.28 |
| 44766.34375 | 20.7 |
| 44766.354166666664 | 18.96 |
| 44766.364583333336 | 17.58 |
| 44766.375 | 19.24 |
| 44766.385416666664 | 18.9 |
| 44766.395833333336 | 18.32 |
| 44766.40625 | 17.72 |
| 44766.416666666664 | 20.57 |
| 44766.427083333336 | 14.75 |
| 44766.4375 | 15.83 |
| 44766.447916666664 | 16.38 |
| 44766.458333333336 | 19.71 |
| 44766.46875 | 16.98 |
| 44766.479166666664 | 17.92 |
| 44766.489583333336 | 18.7 |
| 44766.5 | 19.58 |
| 44766.510416666664 | 19.97 |
| 44766.520833333336 | 21.42 |
| 44766.53125 | 22.85 |
| 44766.541666666664 | 22.82 |
| 44766.552083333336 | 21.92 |
| 44766.5625 | 20.25 |
| 44766.572916666664 | 20.91 |
| 44766.583333333336 | 19.27 |
| 44766.59375 | 19.85 |
| 44766.604166666664 | 21.13 |
| 44766.614583333336 | 20.86 |
| 44766.625 | 19.97 |
| 44766.635416666664 | 20.25 |
| 44766.645833333336 | 19.67 |
| 44766.65625 | 20.65 |
| 44766.666666666664 | 19.16 |
| 44766.677083333336 | 17.26 |
| 44766.6875 | 18.53 |
| 44766.697916666664 | 21.43 |
| 44766.708333333336 | 23.68 |
| 44766.71875 | 21.41 |
| 44766.729166666664 | 22.98 |
| 44766.739583333336 | 26.46 |
| 44766.75 | 28.39 |
| 44766.760416666664 | 28.57 |
| 44766.770833333336 | 31.68 |
| 44766.78125 | 30.73 |
| 44766.791666666664 | 32.37 |
| 44766.802083333336 | 33.02 |
| 44766.8125 | 30.86 |
| 44766.822916666664 | 30.37 |
| 44766.833333333336 | 33.17 |
| 44766.84375 | 33.27 |
| 44766.854166666664 | 32.06 |
| 44766.864583333336 | 30.81 |
| 44766.875 | 32.04 |
| 44766.885416666664 | 31.7 |
| 44766.895833333336 | 30.65 |
| 44766.90625 | 31.24 |
| 44766.916666666664 | 30.39 |
| 44766.927083333336 | 28.08 |
| 44766.9375 | 27.31 |
| 44766.947916666664 | 25.02 |
| 44766.958333333336 | 25.29 |
| 44766.96875 | 16.73 |
| 44766.979166666664 | 21.3 |
| 44766.989583333336 | 16.22 |
| 44767.0 | 21.29 |
| 44767.010416666664 | 16.38 |
| 44767.020833333336 | 19.8 |
| 44767.03125 | 22.69 |
| 44767.041666666664 | 24.62 |
| 44767.052083333336 | 26.02 |
| 44767.0625 | 28.04 |
| 44767.072916666664 | 29.72 |
| 44767.083333333336 | 28.11 |
| 44767.09375 | 29.52 |
| 44767.104166666664 | 27.01 |
| 44767.114583333336 | 26.04 |
| 44767.125 | 25.28 |
| 44767.135416666664 | 24.04 |
| 44767.145833333336 | 26.51 |
| 44767.15625 | 20.22 |
| 44767.166666666664 | 17.45 |
| 44767.177083333336 | 19.49 |
| 44767.1875 | 19.15 |
| 44767.197916666664 | 18.48 |
| 44767.208333333336 | 18.33 |
| 44767.21875 | 18.02 |
| 44767.229166666664 | 18.25 |
| 44767.239583333336 | 19.44 |
| 44767.25 | 22.7 |
| 44767.260416666664 | 19.63 |
| 44767.270833333336 | 22 |
| 44767.28125 | 22.97 |
| 44767.291666666664 | 22.86 |
| 44767.302083333336 | 21.68 |
| 44767.3125 | 22.87 |
| 44767.322916666664 | 24.13 |
| 44767.333333333336 | 22.74 |
| 44767.34375 | 25.45 |
| 44767.354166666664 | 25.29 |
| 44767.364583333336 | 25.18 |
| 44767.375 | 23.78 |
| 44767.385416666664 | 24.98 |
| 44767.395833333336 | 22.54 |
| 44767.40625 | 22.42 |
| 44767.416666666664 | 22.48 |
| 44767.427083333336 | 21.66 |
| 44767.4375 | 20.06 |
| 44767.447916666664 | 18.39 |
| 44767.458333333336 | 16.37 |
| 44767.46875 | 17.58 |
| 44767.479166666664 | 17.35 |
| 44767.489583333336 | 15.66 |
| 44767.5 | 17.79 |
| 44767.510416666664 | 17.95 |
| 44767.520833333336 | 20.92 |
| 44767.53125 | 21.63 |
| 44767.541666666664 | 22.85 |
| 44767.552083333336 | 24.69 |
| 44767.5625 | 25.46 |
| 44767.572916666664 | 25.94 |
| 44767.583333333336 | 23.81 |
| 44767.59375 | 25.15 |
| 44767.604166666664 | 24.36 |
| 44767.614583333336 | 25.08 |
| 44767.625 | 23.41 |
| 44767.635416666664 | 24.23 |
| 44767.645833333336 | 21.82 |
| 44767.65625 | 21.57 |
| 44767.666666666664 | 23.8 |
| 44767.677083333336 | 26.44 |
| 44767.6875 | 25.86 |
| 44767.697916666664 | 25.73 |
| 44767.708333333336 | 25.87 |
| 44767.71875 | 23.38 |
| 44767.729166666664 | 21.92 |
| 44767.739583333336 | 28.35 |
| 44767.75 | 29.67 |
| 44767.760416666664 | 30.33 |
| 44767.770833333336 | 32.41 |
| 44767.78125 | 39.17 |
| 44767.791666666664 | 45.17 |
| 44767.802083333336 | 51.33 |
| 44767.8125 | 61.17 |
| 44767.822916666664 | 64.98 |
| 44767.833333333336 | 68.07 |
| 44767.84375 | 64.79 |
| 44767.854166666664 | 66.04 |
| 44767.864583333336 | 60.66 |
| 44767.875 | 63 |
| 44767.885416666664 | 57.95 |
| 44767.895833333336 | 54.48 |
| 44767.90625 | 47.65 |
| 44767.916666666664 | 46.57 |
| 44767.927083333336 | 42.82 |
| 44767.9375 | 43.15 |
| 44767.947916666664 | 40.7 |
| 44767.958333333336 | 37.01 |
| 44767.96875 | 33.14 |
| 44767.979166666664 | 29.52 |
| 44767.989583333336 | 21.38 |
| 44768.0 | 20.02 |
| 44768.010416666664 | 23.97 |
| 44768.020833333336 | 25.96 |
| 44768.03125 | 24.1 |
| 44768.041666666664 | 26.71 |
| 44768.052083333336 | 30.57 |
| 44768.0625 | 30.38 |
| 44768.072916666664 | 30.84 |
| 44768.083333333336 | 36.62 |
| 44768.09375 | 44.04 |
| 44768.104166666664 | 37.06 |
| 44768.114583333336 | 38.62 |
| 44768.125 | 35.93 |
| 44768.135416666664 | 25.32 |
| 44768.145833333336 | 21.05 |
| 44768.15625 | 19.66 |
| 44768.166666666664 | 19.22 |
| 44768.177083333336 | 17.74 |
| 44768.1875 | 17.35 |
| 44768.197916666664 | 16.64 |
| 44768.208333333336 | 17.54 |
| 44768.21875 | 20.07 |
| 44768.229166666664 | 21.7 |
| 44768.239583333336 | 22.52 |
| 44768.25 | 18.83 |
| 44768.260416666664 | 22.58 |
| 44768.270833333336 | 23.46 |
| 44768.28125 | 22.35 |
| 44768.291666666664 | 22.79 |
| 44768.302083333336 | 21.47 |
| 44768.3125 | 21.05 |
| 44768.322916666664 | 21.4 |
| 44768.333333333336 | 22.23 |
| 44768.34375 | 22.46 |
| 44768.354166666664 | 22.84 |
| 44768.364583333336 | 23.79 |
| 44768.375 | 24.21 |
| 44768.385416666664 | 27.03 |
| 44768.395833333336 | 26.53 |
| 44768.40625 | 29.23 |
| 44768.416666666664 | 28.05 |
| 44768.427083333336 | 25.7 |
| 44768.4375 | 24.24 |
| 44768.447916666664 | 22.34 |
| 44768.458333333336 | 18.01 |
| 44768.46875 | 19.68 |
| 44768.479166666664 | 19.76 |
| 44768.489583333336 | 17.88 |
| 44768.5 | 16.05 |
| 44768.510416666664 | 17.93 |
| 44768.520833333336 | 17.61 |
| 44768.53125 | 15.11 |
| 44768.541666666664 | 18.87 |
| 44768.552083333336 | 15.42 |
| 44768.5625 | 18.76 |
| 44768.572916666664 | 19.66 |
| 44768.583333333336 | 24.01 |
| 44768.59375 | 26.06 |
| 44768.604166666664 | 30.17 |
| 44768.614583333336 | 35.7 |
| 44768.625 | 33.01 |
| 44768.635416666664 | 31.78 |
| 44768.645833333336 | 29.95 |
| 44768.65625 | 29.48 |
| 44768.666666666664 | 28.29 |
| 44768.677083333336 | 33.64 |
| 44768.6875 | 27.72 |
| 44768.697916666664 | 21.49 |
| 44768.708333333336 | 18.42 |
| 44768.71875 | 19.32 |
| 44768.729166666664 | 18.37 |
| 44768.739583333336 | 20.92 |
| 44768.75 | 21.33 |
| 44768.760416666664 | 23.46 |
| 44768.770833333336 | 24.47 |
| 44768.78125 | 23.65 |
| 44768.791666666664 | 25.34 |
| 44768.802083333336 | 24.65 |
| 44768.8125 | 26.3 |
| 44768.822916666664 | 29.72 |
| 44768.833333333336 | 28.85 |
| 44768.84375 | 29.29 |
| 44768.854166666664 | 31.89 |
| 44768.864583333336 | 33.88 |
| 44768.875 | 38.06 |
| 44768.885416666664 | 44.03 |
| 44768.895833333336 | 42.47 |
| 44768.90625 | 42.61 |
| 44768.916666666664 | 44.3 |
| 44768.927083333336 | 42.86 |
| 44768.9375 | 36.52 |
| 44768.947916666664 | 35.96 |
| 44768.958333333336 | 29.89 |
| 44768.96875 | 27.1 |
| 44768.979166666664 | 28.51 |
| 44768.989583333336 | 22.47 |
| 44769.0 | 24.35 |
| 44769.010416666664 | 24.13 |
| 44769.020833333336 | 24.29 |
| 44769.03125 | 22.98 |
| 44769.041666666664 | 18.44 |
| 44769.052083333336 | 19.08 |
| 44769.0625 | 20.03 |
| 44769.072916666664 | 21.85 |
| 44769.083333333336 | 21.14 |
| 44769.09375 | 21.59 |
| 44769.104166666664 | 26.99 |
| 44769.114583333336 | 27.01 |
| 44769.125 | 20.89 |
| 44769.135416666664 | 22.58 |
| 44769.145833333336 | 27.89 |
| 44769.15625 | 27.88 |
| 44769.166666666664 | 30.19 |
| 44769.177083333336 | 29.24 |
| 44769.1875 | 30.66 |
| 44769.197916666664 | 29.81 |
| 44769.208333333336 | 28.05 |
| 44769.21875 | 22.07 |
| 44769.229166666664 | 20.13 |
| 44769.239583333336 | 17.92 |
| 44769.25 | 14.84 |
| 44769.260416666664 | 14.44 |
| 44769.270833333336 | 19.82 |
| 44769.28125 | 17.47 |
| 44769.291666666664 | 17.97 |
| 44769.302083333336 | 19.09 |
| 44769.3125 | 20.25 |
| 44769.322916666664 | 19.45 |
| 44769.333333333336 | 21.12 |
| 44769.34375 | 18.78 |
| 44769.354166666664 | 16.36 |
| 44769.364583333336 | 18.04 |
| 44769.375 | 19.38 |
| 44769.385416666664 | 21.43 |
| 44769.395833333336 | 19.28 |
| 44769.40625 | 23.54 |
| 44769.416666666664 | 30.06 |
| 44769.427083333336 | 26.69 |
| 44769.4375 | 26.7 |
| 44769.447916666664 | 27.15 |
| 44769.458333333336 | 26.37 |
| 44769.46875 | 25.09 |
| 44769.479166666664 | 25.01 |
| 44769.489583333336 | 25.37 |
| 44769.5 | 22.37 |
| 44769.510416666664 | 21.61 |
| 44769.520833333336 | 20.18 |
| 44769.53125 | 19.24 |
| 44769.541666666664 | 22.57 |
| 44769.552083333336 | 19.67 |
| 44769.5625 | 18.41 |
| 44769.572916666664 | 17.35 |
| 44769.583333333336 | 19.45 |
| 44769.59375 | 20.25 |
| 44769.604166666664 | 23.06 |
| 44769.614583333336 | 28.09 |
| 44769.625 | 33.87 |
| 44769.635416666664 | 24.94 |
| 44769.645833333336 | 27.81 |
| 44769.65625 | 38.27 |
| 44769.666666666664 | 31.16 |
| 44769.677083333336 | 28.49 |
| 44769.6875 | 27.72 |
| 44769.697916666664 | 25.88 |
| 44769.708333333336 | 27.13 |
| 44769.71875 | 29.75 |
| 44769.729166666664 | 24.96 |
| 44769.739583333336 | 24.12 |
| 44769.75 | 23.57 |
| 44769.760416666664 | 19.65 |
| 44769.770833333336 | 20.4 |
| 44769.78125 | 23.24 |
| 44769.791666666664 | 22.42 |
| 44769.802083333336 | 24.54 |
| 44769.8125 | 25.41 |
| 44769.822916666664 | 24.56 |
| 44769.833333333336 | 26.63 |
| 44769.84375 | 27.88 |
| 44769.854166666664 | 30.72 |
| 44769.864583333336 | 30.26 |
| 44769.875 | 33.03 |
| 44769.885416666664 | 30.39 |
| 44769.895833333336 | 31.54 |
| 44769.90625 | 30.04 |
| 44769.916666666664 | 30.01 |
| 44769.927083333336 | 28.98 |
| 44769.9375 | 28.93 |
| 44769.947916666664 | 30.15 |
| 44769.958333333336 | 28.07 |
| 44769.96875 | 29.39 |
| 44769.979166666664 | 27.89 |
| 44769.989583333336 | 27.91 |
| 44770.0 | 26.86 |
| 44770.010416666664 | 26.05 |
| 44770.020833333336 | 26.3 |
| 44770.03125 | 21.85 |
| 44770.041666666664 | 20.11 |
| 44770.052083333336 | 18.28 |
| 44770.0625 | 15.95 |
| 44770.072916666664 | 16.78 |
| 44770.083333333336 | 16.2 |
| 44770.09375 | 15.25 |
| 44770.104166666664 | 15.79 |
| 44770.114583333336 | 15.32 |
| 44770.125 | 15.58 |
| 44770.135416666664 | 14.45 |
| 44770.145833333336 | 15.84 |
| 44770.15625 | 19.2 |
| 44770.166666666664 | 22.89 |
| 44770.177083333336 | 20.16 |
| 44770.1875 | 23.93 |
| 44770.197916666664 | 25.46 |
| 44770.208333333336 | 26.13 |
| 44770.21875 | 25.29 |
| 44770.229166666664 | 20.49 |
| 44770.239583333336 | 26.23 |
| 44770.25 | 22.54 |
| 44770.260416666664 | 22.8 |
| 44770.270833333336 | 18.42 |
| 44770.28125 | 15.1 |
| 44770.291666666664 | 13.29 |
| 44770.302083333336 | 13.68 |
| 44770.3125 | 12.51 |
| 44770.322916666664 | 14.86 |
| 44770.333333333336 | 15.72 |
| 44770.34375 | 17.5 |
| 44770.354166666664 | 18.99 |
| 44770.364583333336 | 18.45 |
| 44770.375 | 19.01 |
| 44770.385416666664 | 19.16 |
| 44770.395833333336 | 19.18 |
| 44770.40625 | 19.86 |
| 44770.416666666664 | 21.55 |
| 44770.427083333336 | 20.21 |
| 44770.4375 | 23.89 |
| 44770.447916666664 | 23.58 |
| 44770.458333333336 | 24.5 |
| 44770.46875 | 24.76 |
| 44770.479166666664 | 23.13 |
| 44770.489583333336 | 24.3 |
| 44770.5 | 23.78 |
| 44770.510416666664 | 24.02 |
| 44770.520833333336 | 22.23 |
| 44770.53125 | 21.42 |
| 44770.541666666664 | 22.72 |
| 44770.552083333336 | 21.58 |
| 44770.5625 | 21.58 |
| 44770.572916666664 | 20.7 |
| 44770.583333333336 | 21.01 |
| 44770.59375 | 18.05 |
| 44770.604166666664 | 16.49 |
| 44770.614583333336 | 18.82 |
| 44770.625 | 20.66 |
| 44770.635416666664 | 25.61 |
| 44770.645833333336 | 24.73 |
| 44770.65625 | 29.39 |
| 44770.666666666664 | 27.2 |
| 44770.677083333336 | 37.08 |
| 44770.6875 | 25.87 |
| 44770.697916666664 | 26.13 |
| 44770.708333333336 | 24.03 |
| 44770.71875 | 26.03 |
| 44770.729166666664 | 24.42 |
| 44770.739583333336 | 24.27 |
| 44770.75 | 24.89 |
| 44770.760416666664 | 23.11 |
| 44770.770833333336 | 20.46 |
| 44770.78125 | 17.75 |
| 44770.791666666664 | 21.88 |
| 44770.802083333336 | 21.26 |
| 44770.8125 | 19.47 |
| 44770.822916666664 | 21.69 |
| 44770.833333333336 | 21.48 |
| 44770.84375 | 25.39 |
| 44770.854166666664 | 25.94 |
| 44770.864583333336 | 24.48 |
| 44770.875 | 26.86 |
| 44770.885416666664 | 30.28 |
| 44770.895833333336 | 29.13 |
| 44770.90625 | 31.21 |
| 44770.916666666664 | 31.61 |
| 44770.927083333336 | 31.85 |
| 44770.9375 | 30.77 |
| 44770.947916666664 | 31.41 |
| 44770.958333333336 | 29.32 |
| 44770.96875 | 30.05 |
| 44770.979166666664 | 31.53 |
| 44770.989583333336 | 28.85 |
| 44771.0 | 29.82 |
| 44771.010416666664 | 29.43 |
| 44771.020833333336 | 27.57 |
| 44771.03125 | 25.43 |
| 44771.041666666664 | 23.85 |
| 44771.052083333336 | 22.19 |
| 44771.0625 | 20.77 |
| 44771.072916666664 | 20.51 |
| 44771.083333333336 | 17.5 |
| 44771.09375 | 14.64 |
| 44771.104166666664 | 16.39 |
| 44771.114583333336 | 15.17 |
| 44771.125 | 15.41 |
| 44771.135416666664 | 16.78 |
| 44771.145833333336 | 15.09 |
| 44771.15625 | 17.94 |
| 44771.166666666664 | 18.13 |
| 44771.177083333336 | 15.99 |
| 44771.1875 | 16 |
| 44771.197916666664 | 18.17 |
| 44771.208333333336 | 19.51 |
| 44771.21875 | 22.7 |
| 44771.229166666664 | 20.72 |
| 44771.239583333336 | 20.66 |
| 44771.25 | 20.78 |
| 44771.260416666664 | 20.81 |
| 44771.270833333336 | 22.02 |
| 44771.28125 | 19.27 |
| 44771.291666666664 | 16.27 |
| 44771.302083333336 | 14.95 |
| 44771.3125 | 13.78 |
| 44771.322916666664 | 11.73 |
| 44771.333333333336 | 12.25 |
| 44771.34375 | 12.41 |
| 44771.354166666664 | 13.61 |
| 44771.364583333336 | 15.16 |
| 44771.375 | 15.79 |
| 44771.385416666664 | 14.77 |
| 44771.395833333336 | 15.9 |
| 44771.40625 | 15.76 |
| 44771.416666666664 | 17.33 |
| 44771.427083333336 | 18.91 |
| 44771.4375 | 20.27 |
| 44771.447916666664 | 21.7 |
| 44771.458333333336 | 21.59 |
| 44771.46875 | 21.78 |
| 44771.479166666664 | 22.38 |
| 44771.489583333336 | 22.86 |
| 44771.5 | 22.04 |
| 44771.510416666664 | 23.58 |
| 44771.520833333336 | 22.46 |
| 44771.53125 | 21.12 |
| 44771.541666666664 | 21.44 |
| 44771.552083333336 | 22.53 |
| 44771.5625 | 21.46 |
| 44771.572916666664 | 17.75 |
| 44771.583333333336 | 17.8 |
| 44771.59375 | 17.3 |
| 44771.604166666664 | 16.66 |
| 44771.614583333336 | 13.93 |
| 44771.625 | 16.16 |
| 44771.635416666664 | 18.13 |
| 44771.645833333336 | 22.97 |
| 44771.65625 | 24.74 |
| 44771.666666666664 | 23.86 |
| 44771.677083333336 | 24.65 |
| 44771.6875 | 24.32 |
| 44771.697916666664 | 24.16 |
| 44771.708333333336 | 28.35 |
| 44771.71875 | 30.97 |
| 44771.729166666664 | 30.87 |
| 44771.739583333336 | 26.53 |
| 44771.75 | 26.88 |
| 44771.760416666664 | 24.99 |
| 44771.770833333336 | 23.71 |
| 44771.78125 | 24.99 |
| 44771.791666666664 | 29.28 |
| 44771.802083333336 | 23.18 |
| 44771.8125 | 21.96 |
| 44771.822916666664 | 21.57 |
| 44771.833333333336 | 20.52 |
| 44771.84375 | 19.13 |
| 44771.854166666664 | 22.17 |
| 44771.864583333336 | 24.03 |
| 44771.875 | 21.33 |
| 44771.885416666664 | 28.7 |
| 44771.895833333336 | 28.13 |
| 44771.90625 | 26.91 |
| 44771.916666666664 | 25.98 |
| 44771.927083333336 | 27.89 |
| 44771.9375 | 33.4 |
| 44771.947916666664 | 34.03 |
| 44771.958333333336 | 34.43 |
| 44771.96875 | 35.53 |
| 44771.979166666664 | 34.14 |
| 44771.989583333336 | 33.23 |
| 44772.0 | 37.66 |
| 44772.010416666664 | 36.39 |
| 44772.020833333336 | 37.01 |
| 44772.03125 | 35.76 |
| 44772.041666666664 | 29.64 |
| 44772.052083333336 | 25.48 |
| 44772.0625 | 25.39 |
| 44772.072916666664 | 22.81 |
| 44772.083333333336 | 22.35 |
| 44772.09375 | 21.87 |
| 44772.104166666664 | 19.9 |
| 44772.114583333336 | 22.49 |
| 44772.125 | 17.86 |
| 44772.135416666664 | 18.05 |
| 44772.145833333336 | 16.65 |
| 44772.15625 | 17.71 |
| 44772.166666666664 | 18.08 |
| 44772.177083333336 | 19.72 |
| 44772.1875 | 36.57 |
| 44772.197916666664 | 18.82 |
| 44772.208333333336 | 33.1 |
| 44772.21875 | 28.92 |
| 44772.229166666664 | 35.69 |
| 44772.239583333336 | 28.6 |
| 44772.25 | 34.95 |
| 44772.260416666664 | 41.89 |
| 44772.270833333336 | 39.96 |
| 44772.28125 | 41.46 |
| 44772.291666666664 | 34.26 |
| 44772.302083333336 | 25.47 |
| 44772.3125 | 24.57 |
| 44772.322916666664 | 24.97 |
| 44772.333333333336 | 30.19 |
| 44772.34375 | 22.46 |
| 44772.354166666664 | 15.99 |
| 44772.364583333336 | 15.3 |
| 44772.375 | 14.68 |
| 44772.385416666664 | 17.46 |
| 44772.395833333336 | 18.03 |
| 44772.40625 | 17.86 |
| 44772.416666666664 | 18.59 |
| 44772.427083333336 | 21.61 |
| 44772.4375 | 23.13 |
| 44772.447916666664 | 24.24 |
| 44772.458333333336 | 25.25 |
| 44772.46875 | 26.04 |
| 44772.479166666664 | 25.59 |
| 44772.489583333336 | 25.52 |
| 44772.5 | 25.84 |
| 44772.510416666664 | 25.92 |
| 44772.520833333336 | 24.12 |
| 44772.53125 | 23.16 |
| 44772.541666666664 | 22.18 |
| 44772.552083333336 | 22.21 |
| 44772.5625 | 21.52 |
| 44772.572916666664 | 22.45 |
| 44772.583333333336 | 23.34 |
| 44772.59375 | 21.97 |
| 44772.604166666664 | 21.01 |
| 44772.614583333336 | 17.26 |
| 44772.625 | 19.23 |
| 44772.635416666664 | 19.23 |
| 44772.645833333336 | 15.4 |
| 44772.65625 | 16.63 |
| 44772.666666666664 | 19.27 |
| 44772.677083333336 | 47.41 |
| 44772.6875 | 37.08 |
| 44772.697916666664 | 28.83 |
| 44772.708333333336 | 31.38 |
| 44772.71875 | 56.35 |
| 44772.729166666664 | 32.56 |
| 44772.739583333336 | 50.91 |
| 44772.75 | 81.7 |
| 44772.760416666664 | 52.2 |
| 44772.770833333336 | 60.95 |
| 44772.78125 | 48.27 |
| 44772.791666666664 | 28.39 |
| 44772.802083333336 | 35.04 |
| 44772.8125 | 24.67 |
| 44772.822916666664 | 23.5 |
| 44772.833333333336 | 21.88 |
| 44772.84375 | 20.48 |
| 44772.854166666664 | 19.49 |
| 44772.864583333336 | 18.85 |
| 44772.875 | 20.93 |
| 44772.885416666664 | 23.32 |
| 44772.895833333336 | 26.29 |
| 44772.90625 | 25.26 |
| 44772.916666666664 | 26.79 |
| 44772.927083333336 | 28.15 |
| 44772.9375 | 30.71 |
| 44772.947916666664 | 30.59 |
| 44772.958333333336 | 31.52 |
| 44772.96875 | 32.64 |
| 44772.979166666664 | 35.12 |
| 44772.989583333336 | 39.83 |
| 44773.0 | 39.94 |
| 44773.010416666664 | 41.75 |
| 44773.020833333336 | 38.06 |
| 44773.03125 | 35.42 |
| 44773.041666666664 | 32.52 |
| 44773.052083333336 | 30.82 |
| 44773.0625 | 29.22 |
| 44773.072916666664 | 27.95 |
| 44773.083333333336 | 28.32 |
| 44773.09375 | 26.4 |
| 44773.104166666664 | 24.01 |
| 44773.114583333336 | 22.97 |
| 44773.125 | 22.79 |
| 44773.135416666664 | 19.26 |
| 44773.145833333336 | 19.89 |
| 44773.15625 | 17.18 |
| 44773.166666666664 | 17.45 |
| 44773.177083333336 | 20.72 |
| 44773.1875 | 19.34 |
| 44773.197916666664 | 25.06 |
| 44773.208333333336 | 28.74 |
| 44773.21875 | 26.32 |
| 44773.229166666664 | 27.97 |
| 44773.239583333336 | 77.7 |
| 44773.25 | 27.86 |
| 44773.260416666664 | 32.53 |
| 44773.270833333336 | 73.68 |
| 44773.28125 | 105.92 |
| 44773.291666666664 | 93.74 |
| 44773.302083333336 | 106.58 |
| 44773.3125 | 111.06 |
| 44773.322916666664 | 85.12 |
| 44773.333333333336 | 100.83 |
| 44773.34375 | 114.33 |
| 44773.354166666664 | 21.79 |
| 44773.364583333336 | 22.21 |
| 44773.375 | 15.77 |
| 44773.385416666664 | 15.62 |
| 44773.395833333336 | 17.72 |
| 44773.40625 | 19.34 |
| 44773.416666666664 | 22.03 |
| 44773.427083333336 | 23.71 |
| 44773.4375 | 25.41 |
| 44773.447916666664 | 25.68 |
| 44773.458333333336 | 28.12 |
| 44773.46875 | 27.91 |
| 44773.479166666664 | 29.1 |
| 44773.489583333336 | 32.24 |
| 44773.5 | 31.69 |
| 44773.510416666664 | 32.75 |
| 44773.520833333336 | 33.36 |
| 44773.53125 | 32.72 |
| 44773.541666666664 | 30.72 |
| 44773.552083333336 | 29.86 |
| 44773.5625 | 28.26 |
| 44773.572916666664 | 33.9 |
| 44773.583333333336 | 26.47 |
| 44773.59375 | 25.59 |
| 44773.604166666664 | 24.26 |
| 44773.614583333336 | 23.34 |
| 44773.625 | 22.47 |
| 44773.635416666664 | 19.31 |
| 44773.645833333336 | 18.29 |
| 44773.65625 | 18.31 |
| 44773.666666666664 | 22.24 |
| 44773.677083333336 | 24.35 |
| 44773.6875 | 27.21 |
| 44773.697916666664 | 31.89 |
| 44773.708333333336 | 34.43 |
| 44773.71875 | 31.22 |
| 44773.729166666664 | 40.13 |
| 44773.739583333336 | 34.63 |
| 44773.75 | 47.57 |
| 44773.760416666664 | 172.49 |
| 44773.770833333336 | 257.92 |
| 44773.78125 | 58.94 |
| 44773.791666666664 | 206.39 |
| 44773.802083333336 | 172.31 |
| 44773.8125 | 45.84 |
| 44773.822916666664 | 248.64 |
| 44773.833333333336 | 184.61 |
| 44773.84375 | 42.89 |
| 44773.854166666664 | 32.53 |
| 44773.864583333336 | 28.67 |
| 44773.875 | 27.41 |
| 44773.885416666664 | 27.06 |
| 44773.895833333336 | 28.08 |
| 44773.90625 | 30.92 |
| 44773.916666666664 | 44.84 |
| 44773.927083333336 | 40.47 |
| 44773.9375 | 37.3 |
| 44773.947916666664 | 38.78 |
| 44773.958333333336 | 40.93 |
| 44773.96875 | 44.61 |
| 44773.979166666664 | 42.36 |
| 44773.989583333336 | 42.84 |
| 44774.0 | 43.48 |
| 44774.010416666664 | 49.37 |
| 44774.020833333336 | 50.12 |
| 44774.03125 | 49.5 |
| 44774.041666666664 | 44.81 |
| 44774.052083333336 | 53.16 |
| 44774.0625 | 43.64 |
| 44774.072916666664 | 42.71 |
| 44774.083333333336 | 38.35 |
| 44774.09375 | 35.34 |
| 44774.104166666664 | 34.92 |
| 44774.114583333336 | 34.41 |
| 44774.125 | 31.59 |
| 44774.135416666664 | 33.64 |
| 44774.145833333336 | 37.71 |
| 44774.15625 | 26.01 |